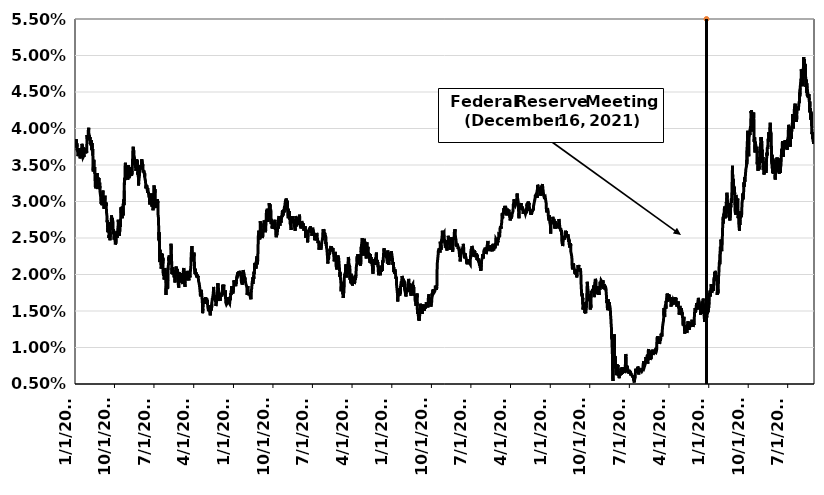
| Category | Series 0 |
|---|---|
| 1/1/10 | 0.038 |
| 1/4/10 | 0.038 |
| 1/5/10 | 0.038 |
| 1/6/10 | 0.038 |
| 1/7/10 | 0.038 |
| 1/8/10 | 0.038 |
| 1/11/10 | 0.038 |
| 1/12/10 | 0.037 |
| 1/13/10 | 0.038 |
| 1/14/10 | 0.038 |
| 1/15/10 | 0.037 |
| 1/18/10 | 0.037 |
| 1/19/10 | 0.037 |
| 1/20/10 | 0.037 |
| 1/21/10 | 0.036 |
| 1/22/10 | 0.036 |
| 1/25/10 | 0.037 |
| 1/26/10 | 0.036 |
| 1/27/10 | 0.037 |
| 1/28/10 | 0.037 |
| 1/29/10 | 0.036 |
| 2/1/10 | 0.037 |
| 2/2/10 | 0.037 |
| 2/3/10 | 0.037 |
| 2/4/10 | 0.036 |
| 2/5/10 | 0.036 |
| 2/8/10 | 0.036 |
| 2/9/10 | 0.037 |
| 2/10/10 | 0.037 |
| 2/11/10 | 0.037 |
| 2/12/10 | 0.037 |
| 2/15/10 | 0.037 |
| 2/16/10 | 0.037 |
| 2/17/10 | 0.037 |
| 2/18/10 | 0.038 |
| 2/19/10 | 0.038 |
| 2/22/10 | 0.038 |
| 2/23/10 | 0.037 |
| 2/24/10 | 0.037 |
| 2/25/10 | 0.036 |
| 2/26/10 | 0.036 |
| 3/1/10 | 0.036 |
| 3/2/10 | 0.036 |
| 3/3/10 | 0.036 |
| 3/4/10 | 0.036 |
| 3/5/10 | 0.037 |
| 3/8/10 | 0.037 |
| 3/9/10 | 0.037 |
| 3/10/10 | 0.037 |
| 3/11/10 | 0.037 |
| 3/12/10 | 0.037 |
| 3/15/10 | 0.037 |
| 3/16/10 | 0.037 |
| 3/17/10 | 0.036 |
| 3/18/10 | 0.037 |
| 3/19/10 | 0.037 |
| 3/22/10 | 0.037 |
| 3/23/10 | 0.037 |
| 3/24/10 | 0.038 |
| 3/25/10 | 0.039 |
| 3/26/10 | 0.039 |
| 3/29/10 | 0.039 |
| 3/30/10 | 0.039 |
| 3/31/10 | 0.038 |
| 4/1/10 | 0.039 |
| 4/2/10 | 0.04 |
| 4/5/10 | 0.04 |
| 4/6/10 | 0.04 |
| 4/7/10 | 0.039 |
| 4/8/10 | 0.039 |
| 4/9/10 | 0.039 |
| 4/12/10 | 0.039 |
| 4/13/10 | 0.038 |
| 4/14/10 | 0.039 |
| 4/15/10 | 0.039 |
| 4/16/10 | 0.038 |
| 4/19/10 | 0.038 |
| 4/20/10 | 0.038 |
| 4/21/10 | 0.038 |
| 4/22/10 | 0.038 |
| 4/23/10 | 0.038 |
| 4/26/10 | 0.038 |
| 4/27/10 | 0.037 |
| 4/28/10 | 0.038 |
| 4/29/10 | 0.038 |
| 4/30/10 | 0.037 |
| 5/3/10 | 0.037 |
| 5/4/10 | 0.036 |
| 5/5/10 | 0.036 |
| 5/6/10 | 0.034 |
| 5/7/10 | 0.034 |
| 5/10/10 | 0.036 |
| 5/11/10 | 0.036 |
| 5/12/10 | 0.036 |
| 5/13/10 | 0.036 |
| 5/14/10 | 0.034 |
| 5/17/10 | 0.035 |
| 5/18/10 | 0.034 |
| 5/19/10 | 0.034 |
| 5/20/10 | 0.032 |
| 5/21/10 | 0.032 |
| 5/24/10 | 0.032 |
| 5/25/10 | 0.032 |
| 5/26/10 | 0.032 |
| 5/27/10 | 0.033 |
| 5/28/10 | 0.033 |
| 5/31/10 | 0.033 |
| 6/1/10 | 0.033 |
| 6/2/10 | 0.034 |
| 6/3/10 | 0.034 |
| 6/4/10 | 0.032 |
| 6/7/10 | 0.032 |
| 6/8/10 | 0.032 |
| 6/9/10 | 0.032 |
| 6/10/10 | 0.033 |
| 6/11/10 | 0.032 |
| 6/14/10 | 0.033 |
| 6/15/10 | 0.033 |
| 6/16/10 | 0.033 |
| 6/17/10 | 0.032 |
| 6/18/10 | 0.032 |
| 6/21/10 | 0.033 |
| 6/22/10 | 0.032 |
| 6/23/10 | 0.031 |
| 6/24/10 | 0.031 |
| 6/25/10 | 0.031 |
| 6/28/10 | 0.03 |
| 6/29/10 | 0.03 |
| 6/30/10 | 0.03 |
| 7/1/10 | 0.03 |
| 7/2/10 | 0.03 |
| 7/5/10 | 0.03 |
| 7/6/10 | 0.03 |
| 7/7/10 | 0.03 |
| 7/8/10 | 0.03 |
| 7/9/10 | 0.031 |
| 7/12/10 | 0.031 |
| 7/13/10 | 0.032 |
| 7/14/10 | 0.031 |
| 7/15/10 | 0.03 |
| 7/16/10 | 0.03 |
| 7/19/10 | 0.03 |
| 7/20/10 | 0.03 |
| 7/21/10 | 0.029 |
| 7/22/10 | 0.03 |
| 7/23/10 | 0.03 |
| 7/26/10 | 0.03 |
| 7/27/10 | 0.031 |
| 7/28/10 | 0.03 |
| 7/29/10 | 0.03 |
| 7/30/10 | 0.029 |
| 8/2/10 | 0.03 |
| 8/3/10 | 0.029 |
| 8/4/10 | 0.03 |
| 8/5/10 | 0.029 |
| 8/6/10 | 0.029 |
| 8/9/10 | 0.029 |
| 8/10/10 | 0.028 |
| 8/11/10 | 0.027 |
| 8/12/10 | 0.027 |
| 8/13/10 | 0.027 |
| 8/16/10 | 0.026 |
| 8/17/10 | 0.026 |
| 8/18/10 | 0.026 |
| 8/19/10 | 0.026 |
| 8/20/10 | 0.026 |
| 8/23/10 | 0.026 |
| 8/24/10 | 0.025 |
| 8/25/10 | 0.025 |
| 8/26/10 | 0.025 |
| 8/27/10 | 0.027 |
| 8/30/10 | 0.025 |
| 8/31/10 | 0.025 |
| 9/1/10 | 0.026 |
| 9/2/10 | 0.026 |
| 9/3/10 | 0.027 |
| 9/6/10 | 0.027 |
| 9/7/10 | 0.026 |
| 9/8/10 | 0.027 |
| 9/9/10 | 0.028 |
| 9/10/10 | 0.028 |
| 9/13/10 | 0.027 |
| 9/14/10 | 0.027 |
| 9/15/10 | 0.027 |
| 9/16/10 | 0.028 |
| 9/17/10 | 0.028 |
| 9/20/10 | 0.027 |
| 9/21/10 | 0.026 |
| 9/22/10 | 0.026 |
| 9/23/10 | 0.026 |
| 9/24/10 | 0.026 |
| 9/27/10 | 0.025 |
| 9/28/10 | 0.025 |
| 9/29/10 | 0.025 |
| 9/30/10 | 0.025 |
| 10/1/10 | 0.025 |
| 10/4/10 | 0.025 |
| 10/5/10 | 0.025 |
| 10/6/10 | 0.024 |
| 10/7/10 | 0.024 |
| 10/8/10 | 0.024 |
| 10/12/10 | 0.024 |
| 10/13/10 | 0.025 |
| 10/14/10 | 0.025 |
| 10/15/10 | 0.026 |
| 10/18/10 | 0.025 |
| 10/19/10 | 0.025 |
| 10/20/10 | 0.025 |
| 10/21/10 | 0.026 |
| 10/22/10 | 0.026 |
| 10/25/10 | 0.026 |
| 10/26/10 | 0.027 |
| 10/27/10 | 0.028 |
| 10/28/10 | 0.027 |
| 10/29/10 | 0.026 |
| 11/1/10 | 0.027 |
| 11/2/10 | 0.026 |
| 11/3/10 | 0.027 |
| 11/4/10 | 0.025 |
| 11/5/10 | 0.026 |
| 11/8/10 | 0.026 |
| 11/9/10 | 0.027 |
| 11/10/10 | 0.026 |
| 11/11/10 | 0.026 |
| 11/12/10 | 0.028 |
| 11/15/10 | 0.029 |
| 11/16/10 | 0.028 |
| 11/17/10 | 0.029 |
| 11/18/10 | 0.029 |
| 11/19/10 | 0.029 |
| 11/22/10 | 0.028 |
| 11/23/10 | 0.028 |
| 11/24/10 | 0.029 |
| 11/25/10 | 0.029 |
| 11/26/10 | 0.029 |
| 11/29/10 | 0.028 |
| 11/30/10 | 0.028 |
| 12/1/10 | 0.03 |
| 12/2/10 | 0.03 |
| 12/3/10 | 0.03 |
| 12/6/10 | 0.03 |
| 12/7/10 | 0.032 |
| 12/8/10 | 0.033 |
| 12/9/10 | 0.032 |
| 12/10/10 | 0.033 |
| 12/13/10 | 0.033 |
| 12/14/10 | 0.035 |
| 12/15/10 | 0.035 |
| 12/16/10 | 0.035 |
| 12/17/10 | 0.033 |
| 12/20/10 | 0.034 |
| 12/21/10 | 0.034 |
| 12/22/10 | 0.034 |
| 12/23/10 | 0.034 |
| 12/24/10 | 0.034 |
| 12/27/10 | 0.034 |
| 12/28/10 | 0.035 |
| 12/29/10 | 0.034 |
| 12/30/10 | 0.034 |
| 12/31/10 | 0.033 |
| 1/3/11 | 0.034 |
| 1/4/11 | 0.034 |
| 1/5/11 | 0.035 |
| 1/6/11 | 0.034 |
| 1/7/11 | 0.033 |
| 1/10/11 | 0.033 |
| 1/11/11 | 0.034 |
| 1/12/11 | 0.034 |
| 1/13/11 | 0.033 |
| 1/14/11 | 0.034 |
| 1/17/11 | 0.034 |
| 1/18/11 | 0.034 |
| 1/19/11 | 0.034 |
| 1/20/11 | 0.035 |
| 1/21/11 | 0.034 |
| 1/24/11 | 0.034 |
| 1/25/11 | 0.034 |
| 1/26/11 | 0.034 |
| 1/27/11 | 0.034 |
| 1/28/11 | 0.034 |
| 1/31/11 | 0.034 |
| 2/1/11 | 0.035 |
| 2/2/11 | 0.035 |
| 2/3/11 | 0.036 |
| 2/4/11 | 0.037 |
| 2/7/11 | 0.037 |
| 2/8/11 | 0.038 |
| 2/9/11 | 0.036 |
| 2/10/11 | 0.037 |
| 2/11/11 | 0.036 |
| 2/14/11 | 0.036 |
| 2/15/11 | 0.036 |
| 2/16/11 | 0.036 |
| 2/17/11 | 0.036 |
| 2/18/11 | 0.036 |
| 2/21/11 | 0.036 |
| 2/22/11 | 0.035 |
| 2/23/11 | 0.035 |
| 2/24/11 | 0.035 |
| 2/25/11 | 0.034 |
| 2/28/11 | 0.034 |
| 3/1/11 | 0.034 |
| 3/2/11 | 0.035 |
| 3/3/11 | 0.036 |
| 3/4/11 | 0.035 |
| 3/7/11 | 0.035 |
| 3/8/11 | 0.036 |
| 3/9/11 | 0.035 |
| 3/10/11 | 0.034 |
| 3/11/11 | 0.034 |
| 3/14/11 | 0.034 |
| 3/15/11 | 0.033 |
| 3/16/11 | 0.032 |
| 3/17/11 | 0.032 |
| 3/18/11 | 0.033 |
| 3/21/11 | 0.033 |
| 3/22/11 | 0.033 |
| 3/23/11 | 0.034 |
| 3/24/11 | 0.034 |
| 3/25/11 | 0.035 |
| 3/28/11 | 0.035 |
| 3/29/11 | 0.035 |
| 3/30/11 | 0.035 |
| 3/31/11 | 0.035 |
| 4/1/11 | 0.035 |
| 4/4/11 | 0.034 |
| 4/5/11 | 0.035 |
| 4/6/11 | 0.036 |
| 4/7/11 | 0.036 |
| 4/8/11 | 0.036 |
| 4/11/11 | 0.036 |
| 4/12/11 | 0.035 |
| 4/13/11 | 0.035 |
| 4/14/11 | 0.035 |
| 4/15/11 | 0.034 |
| 4/18/11 | 0.034 |
| 4/19/11 | 0.034 |
| 4/20/11 | 0.034 |
| 4/21/11 | 0.034 |
| 4/22/11 | 0.034 |
| 4/25/11 | 0.034 |
| 4/26/11 | 0.033 |
| 4/27/11 | 0.034 |
| 4/28/11 | 0.033 |
| 4/29/11 | 0.033 |
| 5/2/11 | 0.033 |
| 5/3/11 | 0.033 |
| 5/4/11 | 0.032 |
| 5/5/11 | 0.032 |
| 5/6/11 | 0.032 |
| 5/9/11 | 0.032 |
| 5/10/11 | 0.032 |
| 5/11/11 | 0.032 |
| 5/12/11 | 0.032 |
| 5/13/11 | 0.032 |
| 5/16/11 | 0.032 |
| 5/17/11 | 0.031 |
| 5/18/11 | 0.032 |
| 5/19/11 | 0.032 |
| 5/20/11 | 0.032 |
| 5/23/11 | 0.031 |
| 5/24/11 | 0.031 |
| 5/25/11 | 0.031 |
| 5/26/11 | 0.031 |
| 5/27/11 | 0.031 |
| 5/30/11 | 0.031 |
| 5/31/11 | 0.03 |
| 6/1/11 | 0.03 |
| 6/2/11 | 0.03 |
| 6/3/11 | 0.03 |
| 6/6/11 | 0.03 |
| 6/7/11 | 0.03 |
| 6/8/11 | 0.03 |
| 6/9/11 | 0.03 |
| 6/10/11 | 0.03 |
| 6/13/11 | 0.03 |
| 6/14/11 | 0.031 |
| 6/15/11 | 0.03 |
| 6/16/11 | 0.029 |
| 6/17/11 | 0.029 |
| 6/20/11 | 0.03 |
| 6/21/11 | 0.03 |
| 6/22/11 | 0.03 |
| 6/23/11 | 0.029 |
| 6/24/11 | 0.029 |
| 6/27/11 | 0.03 |
| 6/28/11 | 0.03 |
| 6/29/11 | 0.031 |
| 6/30/11 | 0.032 |
| 7/1/11 | 0.032 |
| 7/4/11 | 0.032 |
| 7/5/11 | 0.032 |
| 7/6/11 | 0.031 |
| 7/7/11 | 0.032 |
| 7/8/11 | 0.03 |
| 7/11/11 | 0.029 |
| 7/12/11 | 0.029 |
| 7/13/11 | 0.029 |
| 7/14/11 | 0.03 |
| 7/15/11 | 0.029 |
| 7/18/11 | 0.029 |
| 7/19/11 | 0.029 |
| 7/20/11 | 0.03 |
| 7/21/11 | 0.03 |
| 7/22/11 | 0.03 |
| 7/25/11 | 0.03 |
| 7/26/11 | 0.03 |
| 7/27/11 | 0.03 |
| 7/28/11 | 0.03 |
| 7/29/11 | 0.028 |
| 8/1/11 | 0.028 |
| 8/2/11 | 0.027 |
| 8/3/11 | 0.026 |
| 8/4/11 | 0.025 |
| 8/5/11 | 0.026 |
| 8/8/11 | 0.024 |
| 8/9/11 | 0.022 |
| 8/10/11 | 0.022 |
| 8/11/11 | 0.023 |
| 8/12/11 | 0.022 |
| 8/15/11 | 0.023 |
| 8/16/11 | 0.022 |
| 8/17/11 | 0.022 |
| 8/18/11 | 0.021 |
| 8/19/11 | 0.021 |
| 8/22/11 | 0.021 |
| 8/23/11 | 0.022 |
| 8/24/11 | 0.023 |
| 8/25/11 | 0.022 |
| 8/26/11 | 0.022 |
| 8/29/11 | 0.023 |
| 8/30/11 | 0.022 |
| 8/31/11 | 0.022 |
| 9/1/11 | 0.022 |
| 9/2/11 | 0.02 |
| 9/5/11 | 0.02 |
| 9/6/11 | 0.02 |
| 9/7/11 | 0.02 |
| 9/8/11 | 0.02 |
| 9/9/11 | 0.019 |
| 9/12/11 | 0.019 |
| 9/13/11 | 0.02 |
| 9/14/11 | 0.02 |
| 9/15/11 | 0.021 |
| 9/16/11 | 0.021 |
| 9/19/11 | 0.02 |
| 9/20/11 | 0.02 |
| 9/21/11 | 0.019 |
| 9/22/11 | 0.017 |
| 9/23/11 | 0.018 |
| 9/26/11 | 0.019 |
| 9/27/11 | 0.02 |
| 9/28/11 | 0.02 |
| 9/29/11 | 0.02 |
| 9/30/11 | 0.019 |
| 10/3/11 | 0.018 |
| 10/4/11 | 0.018 |
| 10/5/11 | 0.019 |
| 10/6/11 | 0.02 |
| 10/7/11 | 0.021 |
| 10/11/11 | 0.022 |
| 10/12/11 | 0.022 |
| 10/13/11 | 0.022 |
| 10/14/11 | 0.023 |
| 10/17/11 | 0.022 |
| 10/18/11 | 0.022 |
| 10/19/11 | 0.022 |
| 10/20/11 | 0.022 |
| 10/21/11 | 0.022 |
| 10/24/11 | 0.022 |
| 10/25/11 | 0.021 |
| 10/26/11 | 0.022 |
| 10/27/11 | 0.024 |
| 10/28/11 | 0.023 |
| 10/31/11 | 0.022 |
| 11/1/11 | 0.02 |
| 11/2/11 | 0.02 |
| 11/3/11 | 0.021 |
| 11/4/11 | 0.021 |
| 11/7/11 | 0.02 |
| 11/8/11 | 0.021 |
| 11/9/11 | 0.02 |
| 11/10/11 | 0.02 |
| 11/14/11 | 0.02 |
| 11/15/11 | 0.021 |
| 11/16/11 | 0.02 |
| 11/17/11 | 0.02 |
| 11/18/11 | 0.02 |
| 11/21/11 | 0.02 |
| 11/22/11 | 0.019 |
| 11/23/11 | 0.019 |
| 11/24/11 | 0.019 |
| 11/25/11 | 0.02 |
| 11/28/11 | 0.02 |
| 11/29/11 | 0.02 |
| 11/30/11 | 0.021 |
| 12/1/11 | 0.021 |
| 12/2/11 | 0.02 |
| 12/5/11 | 0.02 |
| 12/6/11 | 0.021 |
| 12/7/11 | 0.02 |
| 12/8/11 | 0.02 |
| 12/9/11 | 0.021 |
| 12/12/11 | 0.02 |
| 12/13/11 | 0.02 |
| 12/14/11 | 0.019 |
| 12/15/11 | 0.019 |
| 12/16/11 | 0.019 |
| 12/19/11 | 0.018 |
| 12/20/11 | 0.019 |
| 12/21/11 | 0.02 |
| 12/22/11 | 0.02 |
| 12/23/11 | 0.02 |
| 12/26/11 | 0.02 |
| 12/27/11 | 0.02 |
| 12/28/11 | 0.019 |
| 12/29/11 | 0.019 |
| 12/30/11 | 0.019 |
| 1/2/12 | 0.019 |
| 1/3/12 | 0.02 |
| 1/4/12 | 0.02 |
| 1/5/12 | 0.02 |
| 1/6/12 | 0.02 |
| 1/9/12 | 0.02 |
| 1/10/12 | 0.02 |
| 1/11/12 | 0.019 |
| 1/12/12 | 0.019 |
| 1/13/12 | 0.019 |
| 1/16/12 | 0.019 |
| 1/17/12 | 0.019 |
| 1/18/12 | 0.019 |
| 1/19/12 | 0.02 |
| 1/20/12 | 0.02 |
| 1/23/12 | 0.021 |
| 1/24/12 | 0.021 |
| 1/25/12 | 0.02 |
| 1/26/12 | 0.02 |
| 1/27/12 | 0.019 |
| 1/30/12 | 0.019 |
| 1/31/12 | 0.018 |
| 2/1/12 | 0.019 |
| 2/2/12 | 0.019 |
| 2/3/12 | 0.02 |
| 2/6/12 | 0.019 |
| 2/7/12 | 0.02 |
| 2/8/12 | 0.02 |
| 2/9/12 | 0.02 |
| 2/10/12 | 0.02 |
| 2/13/12 | 0.02 |
| 2/14/12 | 0.019 |
| 2/15/12 | 0.019 |
| 2/16/12 | 0.02 |
| 2/17/12 | 0.02 |
| 2/20/12 | 0.02 |
| 2/21/12 | 0.02 |
| 2/22/12 | 0.02 |
| 2/23/12 | 0.02 |
| 2/24/12 | 0.02 |
| 2/27/12 | 0.019 |
| 2/28/12 | 0.019 |
| 2/29/12 | 0.02 |
| 3/1/12 | 0.02 |
| 3/2/12 | 0.02 |
| 3/5/12 | 0.02 |
| 3/6/12 | 0.02 |
| 3/7/12 | 0.02 |
| 3/8/12 | 0.02 |
| 3/9/12 | 0.02 |
| 3/12/12 | 0.02 |
| 3/13/12 | 0.021 |
| 3/14/12 | 0.023 |
| 3/15/12 | 0.023 |
| 3/16/12 | 0.023 |
| 3/19/12 | 0.024 |
| 3/20/12 | 0.024 |
| 3/21/12 | 0.023 |
| 3/22/12 | 0.023 |
| 3/23/12 | 0.022 |
| 3/26/12 | 0.023 |
| 3/27/12 | 0.022 |
| 3/28/12 | 0.022 |
| 3/29/12 | 0.022 |
| 3/30/12 | 0.022 |
| 4/2/12 | 0.022 |
| 4/3/12 | 0.023 |
| 4/4/12 | 0.022 |
| 4/5/12 | 0.022 |
| 4/6/12 | 0.021 |
| 4/9/12 | 0.021 |
| 4/10/12 | 0.02 |
| 4/11/12 | 0.02 |
| 4/12/12 | 0.021 |
| 4/13/12 | 0.02 |
| 4/16/12 | 0.02 |
| 4/17/12 | 0.02 |
| 4/18/12 | 0.02 |
| 4/19/12 | 0.02 |
| 4/20/12 | 0.02 |
| 4/23/12 | 0.02 |
| 4/24/12 | 0.02 |
| 4/25/12 | 0.02 |
| 4/26/12 | 0.02 |
| 4/27/12 | 0.02 |
| 4/30/12 | 0.02 |
| 5/1/12 | 0.02 |
| 5/2/12 | 0.02 |
| 5/3/12 | 0.02 |
| 5/4/12 | 0.019 |
| 5/7/12 | 0.019 |
| 5/8/12 | 0.019 |
| 5/9/12 | 0.019 |
| 5/10/12 | 0.019 |
| 5/11/12 | 0.018 |
| 5/14/12 | 0.018 |
| 5/15/12 | 0.018 |
| 5/16/12 | 0.018 |
| 5/17/12 | 0.017 |
| 5/18/12 | 0.017 |
| 5/21/12 | 0.018 |
| 5/22/12 | 0.018 |
| 5/23/12 | 0.017 |
| 5/24/12 | 0.018 |
| 5/25/12 | 0.018 |
| 5/28/12 | 0.018 |
| 5/29/12 | 0.017 |
| 5/30/12 | 0.016 |
| 5/31/12 | 0.016 |
| 6/1/12 | 0.015 |
| 6/4/12 | 0.015 |
| 6/5/12 | 0.016 |
| 6/6/12 | 0.017 |
| 6/7/12 | 0.017 |
| 6/8/12 | 0.016 |
| 6/11/12 | 0.016 |
| 6/12/12 | 0.017 |
| 6/13/12 | 0.016 |
| 6/14/12 | 0.016 |
| 6/15/12 | 0.016 |
| 6/18/12 | 0.016 |
| 6/19/12 | 0.016 |
| 6/20/12 | 0.016 |
| 6/21/12 | 0.016 |
| 6/22/12 | 0.017 |
| 6/25/12 | 0.016 |
| 6/26/12 | 0.017 |
| 6/27/12 | 0.016 |
| 6/28/12 | 0.016 |
| 6/29/12 | 0.017 |
| 7/2/12 | 0.016 |
| 7/3/12 | 0.016 |
| 7/4/12 | 0.016 |
| 7/5/12 | 0.016 |
| 7/6/12 | 0.016 |
| 7/9/12 | 0.015 |
| 7/10/12 | 0.015 |
| 7/11/12 | 0.015 |
| 7/12/12 | 0.015 |
| 7/13/12 | 0.015 |
| 7/16/12 | 0.015 |
| 7/17/12 | 0.015 |
| 7/18/12 | 0.015 |
| 7/19/12 | 0.015 |
| 7/20/12 | 0.015 |
| 7/23/12 | 0.015 |
| 7/24/12 | 0.014 |
| 7/25/12 | 0.014 |
| 7/26/12 | 0.014 |
| 7/27/12 | 0.016 |
| 7/30/12 | 0.015 |
| 7/31/12 | 0.015 |
| 8/1/12 | 0.016 |
| 8/2/12 | 0.015 |
| 8/3/12 | 0.016 |
| 8/6/12 | 0.016 |
| 8/7/12 | 0.017 |
| 8/8/12 | 0.017 |
| 8/9/12 | 0.017 |
| 8/10/12 | 0.016 |
| 8/13/12 | 0.016 |
| 8/14/12 | 0.017 |
| 8/15/12 | 0.018 |
| 8/16/12 | 0.018 |
| 8/17/12 | 0.018 |
| 8/20/12 | 0.018 |
| 8/21/12 | 0.018 |
| 8/22/12 | 0.017 |
| 8/23/12 | 0.017 |
| 8/24/12 | 0.017 |
| 8/27/12 | 0.016 |
| 8/28/12 | 0.016 |
| 8/29/12 | 0.017 |
| 8/30/12 | 0.016 |
| 8/31/12 | 0.016 |
| 9/3/12 | 0.016 |
| 9/4/12 | 0.016 |
| 9/5/12 | 0.016 |
| 9/6/12 | 0.017 |
| 9/7/12 | 0.017 |
| 9/10/12 | 0.017 |
| 9/11/12 | 0.017 |
| 9/12/12 | 0.018 |
| 9/13/12 | 0.018 |
| 9/14/12 | 0.019 |
| 9/17/12 | 0.019 |
| 9/18/12 | 0.018 |
| 9/19/12 | 0.018 |
| 9/20/12 | 0.018 |
| 9/21/12 | 0.018 |
| 9/24/12 | 0.017 |
| 9/25/12 | 0.017 |
| 9/26/12 | 0.016 |
| 9/27/12 | 0.017 |
| 9/28/12 | 0.016 |
| 10/1/12 | 0.016 |
| 10/2/12 | 0.016 |
| 10/3/12 | 0.016 |
| 10/4/12 | 0.017 |
| 10/5/12 | 0.018 |
| 10/9/12 | 0.017 |
| 10/10/12 | 0.017 |
| 10/11/12 | 0.017 |
| 10/12/12 | 0.017 |
| 10/15/12 | 0.017 |
| 10/16/12 | 0.018 |
| 10/17/12 | 0.018 |
| 10/18/12 | 0.019 |
| 10/19/12 | 0.018 |
| 10/22/12 | 0.018 |
| 10/23/12 | 0.018 |
| 10/24/12 | 0.018 |
| 10/25/12 | 0.019 |
| 10/26/12 | 0.018 |
| 10/29/12 | 0.017 |
| 10/30/12 | 0.017 |
| 10/31/12 | 0.017 |
| 11/1/12 | 0.018 |
| 11/2/12 | 0.018 |
| 11/5/12 | 0.017 |
| 11/6/12 | 0.018 |
| 11/7/12 | 0.017 |
| 11/8/12 | 0.016 |
| 11/9/12 | 0.016 |
| 11/13/12 | 0.016 |
| 11/14/12 | 0.016 |
| 11/15/12 | 0.016 |
| 11/16/12 | 0.016 |
| 11/19/12 | 0.016 |
| 11/20/12 | 0.017 |
| 11/21/12 | 0.017 |
| 11/22/12 | 0.017 |
| 11/23/12 | 0.017 |
| 11/26/12 | 0.017 |
| 11/27/12 | 0.016 |
| 11/28/12 | 0.016 |
| 11/29/12 | 0.016 |
| 11/30/12 | 0.016 |
| 12/3/12 | 0.016 |
| 12/4/12 | 0.016 |
| 12/5/12 | 0.016 |
| 12/6/12 | 0.016 |
| 12/7/12 | 0.016 |
| 12/10/12 | 0.016 |
| 12/11/12 | 0.017 |
| 12/12/12 | 0.017 |
| 12/13/12 | 0.017 |
| 12/14/12 | 0.017 |
| 12/17/12 | 0.018 |
| 12/18/12 | 0.018 |
| 12/19/12 | 0.018 |
| 12/20/12 | 0.018 |
| 12/21/12 | 0.018 |
| 12/24/12 | 0.018 |
| 12/25/12 | 0.018 |
| 12/26/12 | 0.018 |
| 12/27/12 | 0.017 |
| 12/28/12 | 0.017 |
| 12/31/12 | 0.018 |
| 1/1/13 | 0.018 |
| 1/2/13 | 0.019 |
| 1/3/13 | 0.019 |
| 1/4/13 | 0.019 |
| 1/7/13 | 0.019 |
| 1/8/13 | 0.019 |
| 1/9/13 | 0.019 |
| 1/10/13 | 0.019 |
| 1/11/13 | 0.019 |
| 1/14/13 | 0.019 |
| 1/15/13 | 0.019 |
| 1/16/13 | 0.018 |
| 1/17/13 | 0.019 |
| 1/18/13 | 0.019 |
| 1/21/13 | 0.019 |
| 1/22/13 | 0.019 |
| 1/23/13 | 0.019 |
| 1/24/13 | 0.019 |
| 1/25/13 | 0.02 |
| 1/28/13 | 0.02 |
| 1/29/13 | 0.02 |
| 1/30/13 | 0.02 |
| 1/31/13 | 0.02 |
| 2/1/13 | 0.02 |
| 2/4/13 | 0.02 |
| 2/5/13 | 0.02 |
| 2/6/13 | 0.02 |
| 2/7/13 | 0.02 |
| 2/8/13 | 0.02 |
| 2/11/13 | 0.02 |
| 2/12/13 | 0.02 |
| 2/13/13 | 0.02 |
| 2/14/13 | 0.02 |
| 2/15/13 | 0.02 |
| 2/18/13 | 0.02 |
| 2/19/13 | 0.02 |
| 2/20/13 | 0.02 |
| 2/21/13 | 0.02 |
| 2/22/13 | 0.02 |
| 2/25/13 | 0.019 |
| 2/26/13 | 0.019 |
| 2/27/13 | 0.019 |
| 2/28/13 | 0.019 |
| 3/1/13 | 0.019 |
| 3/4/13 | 0.019 |
| 3/5/13 | 0.019 |
| 3/6/13 | 0.02 |
| 3/7/13 | 0.02 |
| 3/8/13 | 0.021 |
| 3/11/13 | 0.021 |
| 3/12/13 | 0.02 |
| 3/13/13 | 0.02 |
| 3/14/13 | 0.02 |
| 3/15/13 | 0.02 |
| 3/18/13 | 0.02 |
| 3/19/13 | 0.019 |
| 3/20/13 | 0.02 |
| 3/21/13 | 0.02 |
| 3/22/13 | 0.019 |
| 3/25/13 | 0.019 |
| 3/26/13 | 0.019 |
| 3/27/13 | 0.019 |
| 3/28/13 | 0.019 |
| 3/29/13 | 0.019 |
| 4/1/13 | 0.019 |
| 4/2/13 | 0.019 |
| 4/3/13 | 0.018 |
| 4/4/13 | 0.018 |
| 4/5/13 | 0.017 |
| 4/8/13 | 0.018 |
| 4/9/13 | 0.018 |
| 4/10/13 | 0.018 |
| 4/11/13 | 0.018 |
| 4/12/13 | 0.018 |
| 4/15/13 | 0.017 |
| 4/16/13 | 0.018 |
| 4/17/13 | 0.017 |
| 4/18/13 | 0.017 |
| 4/19/13 | 0.017 |
| 4/22/13 | 0.017 |
| 4/23/13 | 0.017 |
| 4/24/13 | 0.017 |
| 4/25/13 | 0.017 |
| 4/26/13 | 0.017 |
| 4/29/13 | 0.017 |
| 4/30/13 | 0.017 |
| 5/1/13 | 0.017 |
| 5/2/13 | 0.017 |
| 5/3/13 | 0.018 |
| 5/6/13 | 0.018 |
| 5/7/13 | 0.018 |
| 5/8/13 | 0.018 |
| 5/9/13 | 0.018 |
| 5/10/13 | 0.019 |
| 5/13/13 | 0.019 |
| 5/14/13 | 0.02 |
| 5/15/13 | 0.019 |
| 5/16/13 | 0.019 |
| 5/17/13 | 0.02 |
| 5/20/13 | 0.02 |
| 5/21/13 | 0.019 |
| 5/22/13 | 0.02 |
| 5/23/13 | 0.02 |
| 5/24/13 | 0.02 |
| 5/27/13 | 0.02 |
| 5/28/13 | 0.022 |
| 5/29/13 | 0.021 |
| 5/30/13 | 0.021 |
| 5/31/13 | 0.022 |
| 6/3/13 | 0.021 |
| 6/4/13 | 0.021 |
| 6/5/13 | 0.021 |
| 6/6/13 | 0.021 |
| 6/7/13 | 0.022 |
| 6/10/13 | 0.022 |
| 6/11/13 | 0.022 |
| 6/12/13 | 0.022 |
| 6/13/13 | 0.022 |
| 6/14/13 | 0.021 |
| 6/17/13 | 0.022 |
| 6/18/13 | 0.022 |
| 6/19/13 | 0.023 |
| 6/20/13 | 0.024 |
| 6/21/13 | 0.025 |
| 6/24/13 | 0.026 |
| 6/25/13 | 0.026 |
| 6/26/13 | 0.026 |
| 6/27/13 | 0.025 |
| 6/28/13 | 0.025 |
| 7/1/13 | 0.025 |
| 7/2/13 | 0.025 |
| 7/3/13 | 0.025 |
| 7/4/13 | 0.025 |
| 7/5/13 | 0.027 |
| 7/8/13 | 0.026 |
| 7/9/13 | 0.026 |
| 7/10/13 | 0.027 |
| 7/11/13 | 0.026 |
| 7/12/13 | 0.026 |
| 7/15/13 | 0.026 |
| 7/16/13 | 0.026 |
| 7/17/13 | 0.025 |
| 7/18/13 | 0.026 |
| 7/19/13 | 0.025 |
| 7/22/13 | 0.025 |
| 7/23/13 | 0.025 |
| 7/24/13 | 0.026 |
| 7/25/13 | 0.026 |
| 7/26/13 | 0.026 |
| 7/29/13 | 0.026 |
| 7/30/13 | 0.026 |
| 7/31/13 | 0.026 |
| 8/1/13 | 0.027 |
| 8/2/13 | 0.026 |
| 8/5/13 | 0.027 |
| 8/6/13 | 0.027 |
| 8/7/13 | 0.026 |
| 8/8/13 | 0.026 |
| 8/9/13 | 0.026 |
| 8/12/13 | 0.026 |
| 8/13/13 | 0.027 |
| 8/14/13 | 0.027 |
| 8/15/13 | 0.028 |
| 8/16/13 | 0.028 |
| 8/19/13 | 0.029 |
| 8/20/13 | 0.028 |
| 8/21/13 | 0.029 |
| 8/22/13 | 0.029 |
| 8/23/13 | 0.028 |
| 8/26/13 | 0.028 |
| 8/27/13 | 0.027 |
| 8/28/13 | 0.028 |
| 8/29/13 | 0.028 |
| 8/30/13 | 0.028 |
| 9/2/13 | 0.028 |
| 9/3/13 | 0.029 |
| 9/4/13 | 0.029 |
| 9/5/13 | 0.03 |
| 9/6/13 | 0.029 |
| 9/9/13 | 0.029 |
| 9/10/13 | 0.03 |
| 9/11/13 | 0.029 |
| 9/12/13 | 0.029 |
| 9/13/13 | 0.029 |
| 9/16/13 | 0.029 |
| 9/17/13 | 0.029 |
| 9/18/13 | 0.027 |
| 9/19/13 | 0.028 |
| 9/20/13 | 0.028 |
| 9/23/13 | 0.027 |
| 9/24/13 | 0.027 |
| 9/25/13 | 0.026 |
| 9/26/13 | 0.027 |
| 9/27/13 | 0.026 |
| 9/30/13 | 0.026 |
| 10/1/13 | 0.027 |
| 10/2/13 | 0.026 |
| 10/3/13 | 0.026 |
| 10/4/13 | 0.027 |
| 10/7/13 | 0.026 |
| 10/8/13 | 0.027 |
| 10/9/13 | 0.027 |
| 10/10/13 | 0.027 |
| 10/11/13 | 0.027 |
| 10/15/13 | 0.028 |
| 10/16/13 | 0.027 |
| 10/17/13 | 0.026 |
| 10/18/13 | 0.026 |
| 10/21/13 | 0.026 |
| 10/22/13 | 0.025 |
| 10/23/13 | 0.025 |
| 10/24/13 | 0.025 |
| 10/25/13 | 0.025 |
| 10/28/13 | 0.025 |
| 10/29/13 | 0.025 |
| 10/30/13 | 0.026 |
| 10/31/13 | 0.026 |
| 11/1/13 | 0.026 |
| 11/4/13 | 0.026 |
| 11/5/13 | 0.027 |
| 11/6/13 | 0.027 |
| 11/7/13 | 0.026 |
| 11/8/13 | 0.028 |
| 11/12/13 | 0.028 |
| 11/13/13 | 0.028 |
| 11/14/13 | 0.027 |
| 11/15/13 | 0.027 |
| 11/18/13 | 0.027 |
| 11/19/13 | 0.027 |
| 11/20/13 | 0.028 |
| 11/21/13 | 0.028 |
| 11/22/13 | 0.028 |
| 11/25/13 | 0.027 |
| 11/26/13 | 0.027 |
| 11/27/13 | 0.027 |
| 11/28/13 | 0.027 |
| 11/29/13 | 0.028 |
| 12/2/13 | 0.028 |
| 12/3/13 | 0.028 |
| 12/4/13 | 0.028 |
| 12/5/13 | 0.029 |
| 12/6/13 | 0.029 |
| 12/9/13 | 0.029 |
| 12/10/13 | 0.028 |
| 12/11/13 | 0.029 |
| 12/12/13 | 0.029 |
| 12/13/13 | 0.029 |
| 12/16/13 | 0.029 |
| 12/17/13 | 0.028 |
| 12/18/13 | 0.029 |
| 12/19/13 | 0.029 |
| 12/20/13 | 0.029 |
| 12/23/13 | 0.029 |
| 12/24/13 | 0.03 |
| 12/25/13 | 0.03 |
| 12/26/13 | 0.03 |
| 12/27/13 | 0.03 |
| 12/30/13 | 0.03 |
| 12/31/13 | 0.03 |
| 1/1/14 | 0.03 |
| 1/2/14 | 0.03 |
| 1/3/14 | 0.03 |
| 1/6/14 | 0.03 |
| 1/7/14 | 0.03 |
| 1/8/14 | 0.03 |
| 1/9/14 | 0.03 |
| 1/10/14 | 0.029 |
| 1/13/14 | 0.028 |
| 1/14/14 | 0.028 |
| 1/15/14 | 0.029 |
| 1/16/14 | 0.029 |
| 1/17/14 | 0.028 |
| 1/20/14 | 0.028 |
| 1/21/14 | 0.028 |
| 1/22/14 | 0.029 |
| 1/23/14 | 0.028 |
| 1/24/14 | 0.028 |
| 1/27/14 | 0.028 |
| 1/28/14 | 0.028 |
| 1/29/14 | 0.027 |
| 1/30/14 | 0.027 |
| 1/31/14 | 0.027 |
| 2/3/14 | 0.026 |
| 2/4/14 | 0.026 |
| 2/5/14 | 0.027 |
| 2/6/14 | 0.027 |
| 2/7/14 | 0.027 |
| 2/10/14 | 0.027 |
| 2/11/14 | 0.028 |
| 2/12/14 | 0.028 |
| 2/13/14 | 0.027 |
| 2/14/14 | 0.028 |
| 2/17/14 | 0.028 |
| 2/18/14 | 0.027 |
| 2/19/14 | 0.027 |
| 2/20/14 | 0.028 |
| 2/21/14 | 0.027 |
| 2/24/14 | 0.028 |
| 2/25/14 | 0.027 |
| 2/26/14 | 0.027 |
| 2/27/14 | 0.026 |
| 2/28/14 | 0.027 |
| 3/3/14 | 0.026 |
| 3/4/14 | 0.027 |
| 3/5/14 | 0.027 |
| 3/6/14 | 0.027 |
| 3/7/14 | 0.028 |
| 3/10/14 | 0.028 |
| 3/11/14 | 0.028 |
| 3/12/14 | 0.027 |
| 3/13/14 | 0.027 |
| 3/14/14 | 0.026 |
| 3/17/14 | 0.027 |
| 3/18/14 | 0.027 |
| 3/19/14 | 0.028 |
| 3/20/14 | 0.028 |
| 3/21/14 | 0.028 |
| 3/24/14 | 0.027 |
| 3/25/14 | 0.028 |
| 3/26/14 | 0.027 |
| 3/27/14 | 0.027 |
| 3/28/14 | 0.027 |
| 3/31/14 | 0.027 |
| 4/1/14 | 0.028 |
| 4/2/14 | 0.028 |
| 4/3/14 | 0.028 |
| 4/4/14 | 0.027 |
| 4/7/14 | 0.027 |
| 4/8/14 | 0.027 |
| 4/9/14 | 0.027 |
| 4/10/14 | 0.026 |
| 4/11/14 | 0.026 |
| 4/14/14 | 0.026 |
| 4/15/14 | 0.026 |
| 4/16/14 | 0.026 |
| 4/17/14 | 0.027 |
| 4/18/14 | 0.027 |
| 4/21/14 | 0.027 |
| 4/22/14 | 0.027 |
| 4/23/14 | 0.027 |
| 4/24/14 | 0.027 |
| 4/25/14 | 0.027 |
| 4/28/14 | 0.027 |
| 4/29/14 | 0.027 |
| 4/30/14 | 0.027 |
| 5/1/14 | 0.026 |
| 5/2/14 | 0.026 |
| 5/5/14 | 0.026 |
| 5/6/14 | 0.026 |
| 5/7/14 | 0.026 |
| 5/8/14 | 0.026 |
| 5/9/14 | 0.026 |
| 5/12/14 | 0.027 |
| 5/13/14 | 0.026 |
| 5/14/14 | 0.025 |
| 5/15/14 | 0.025 |
| 5/16/14 | 0.025 |
| 5/19/14 | 0.025 |
| 5/20/14 | 0.025 |
| 5/21/14 | 0.025 |
| 5/22/14 | 0.026 |
| 5/23/14 | 0.025 |
| 5/26/14 | 0.025 |
| 5/27/14 | 0.025 |
| 5/28/14 | 0.024 |
| 5/29/14 | 0.024 |
| 5/30/14 | 0.025 |
| 6/2/14 | 0.025 |
| 6/3/14 | 0.026 |
| 6/4/14 | 0.026 |
| 6/5/14 | 0.026 |
| 6/6/14 | 0.026 |
| 6/9/14 | 0.026 |
| 6/10/14 | 0.026 |
| 6/11/14 | 0.026 |
| 6/12/14 | 0.026 |
| 6/13/14 | 0.026 |
| 6/16/14 | 0.026 |
| 6/17/14 | 0.027 |
| 6/18/14 | 0.026 |
| 6/19/14 | 0.026 |
| 6/20/14 | 0.026 |
| 6/23/14 | 0.026 |
| 6/24/14 | 0.026 |
| 6/25/14 | 0.026 |
| 6/26/14 | 0.025 |
| 6/27/14 | 0.025 |
| 6/30/14 | 0.025 |
| 7/1/14 | 0.026 |
| 7/2/14 | 0.026 |
| 7/3/14 | 0.026 |
| 7/4/14 | 0.026 |
| 7/7/14 | 0.026 |
| 7/8/14 | 0.026 |
| 7/9/14 | 0.026 |
| 7/10/14 | 0.026 |
| 7/11/14 | 0.025 |
| 7/14/14 | 0.026 |
| 7/15/14 | 0.026 |
| 7/16/14 | 0.026 |
| 7/17/14 | 0.025 |
| 7/18/14 | 0.025 |
| 7/21/14 | 0.025 |
| 7/22/14 | 0.025 |
| 7/23/14 | 0.025 |
| 7/24/14 | 0.025 |
| 7/25/14 | 0.025 |
| 7/28/14 | 0.025 |
| 7/29/14 | 0.025 |
| 7/30/14 | 0.026 |
| 7/31/14 | 0.026 |
| 8/1/14 | 0.025 |
| 8/4/14 | 0.025 |
| 8/5/14 | 0.025 |
| 8/6/14 | 0.025 |
| 8/7/14 | 0.024 |
| 8/8/14 | 0.024 |
| 8/11/14 | 0.024 |
| 8/12/14 | 0.025 |
| 8/13/14 | 0.024 |
| 8/14/14 | 0.024 |
| 8/15/14 | 0.023 |
| 8/18/14 | 0.024 |
| 8/19/14 | 0.024 |
| 8/20/14 | 0.024 |
| 8/21/14 | 0.024 |
| 8/22/14 | 0.024 |
| 8/25/14 | 0.024 |
| 8/26/14 | 0.024 |
| 8/27/14 | 0.024 |
| 8/28/14 | 0.023 |
| 8/29/14 | 0.024 |
| 9/1/14 | 0.024 |
| 9/2/14 | 0.024 |
| 9/3/14 | 0.024 |
| 9/4/14 | 0.024 |
| 9/5/14 | 0.025 |
| 9/8/14 | 0.025 |
| 9/9/14 | 0.025 |
| 9/10/14 | 0.025 |
| 9/11/14 | 0.025 |
| 9/12/14 | 0.026 |
| 9/15/14 | 0.026 |
| 9/16/14 | 0.026 |
| 9/17/14 | 0.026 |
| 9/18/14 | 0.026 |
| 9/19/14 | 0.026 |
| 9/22/14 | 0.026 |
| 9/23/14 | 0.025 |
| 9/24/14 | 0.026 |
| 9/25/14 | 0.025 |
| 9/26/14 | 0.025 |
| 9/29/14 | 0.025 |
| 9/30/14 | 0.025 |
| 10/1/14 | 0.024 |
| 10/2/14 | 0.024 |
| 10/3/14 | 0.024 |
| 10/6/14 | 0.024 |
| 10/7/14 | 0.024 |
| 10/8/14 | 0.024 |
| 10/9/14 | 0.023 |
| 10/10/14 | 0.023 |
| 10/14/14 | 0.022 |
| 10/15/14 | 0.022 |
| 10/16/14 | 0.022 |
| 10/17/14 | 0.022 |
| 10/20/14 | 0.022 |
| 10/21/14 | 0.022 |
| 10/22/14 | 0.022 |
| 10/23/14 | 0.023 |
| 10/24/14 | 0.023 |
| 10/27/14 | 0.023 |
| 10/28/14 | 0.023 |
| 10/29/14 | 0.023 |
| 10/30/14 | 0.023 |
| 10/31/14 | 0.024 |
| 11/3/14 | 0.024 |
| 11/4/14 | 0.024 |
| 11/5/14 | 0.024 |
| 11/6/14 | 0.024 |
| 11/7/14 | 0.023 |
| 11/10/14 | 0.024 |
| 11/12/14 | 0.024 |
| 11/13/14 | 0.024 |
| 11/14/14 | 0.023 |
| 11/17/14 | 0.023 |
| 11/18/14 | 0.023 |
| 11/19/14 | 0.024 |
| 11/20/14 | 0.023 |
| 11/21/14 | 0.023 |
| 11/24/14 | 0.023 |
| 11/25/14 | 0.023 |
| 11/26/14 | 0.022 |
| 11/27/14 | 0.022 |
| 11/28/14 | 0.022 |
| 12/1/14 | 0.022 |
| 12/2/14 | 0.023 |
| 12/3/14 | 0.023 |
| 12/4/14 | 0.022 |
| 12/5/14 | 0.023 |
| 12/8/14 | 0.023 |
| 12/9/14 | 0.022 |
| 12/10/14 | 0.022 |
| 12/11/14 | 0.022 |
| 12/12/14 | 0.021 |
| 12/15/14 | 0.021 |
| 12/16/14 | 0.021 |
| 12/17/14 | 0.021 |
| 12/18/14 | 0.022 |
| 12/19/14 | 0.022 |
| 12/22/14 | 0.022 |
| 12/23/14 | 0.023 |
| 12/24/14 | 0.023 |
| 12/25/14 | 0.023 |
| 12/26/14 | 0.022 |
| 12/29/14 | 0.022 |
| 12/30/14 | 0.022 |
| 12/31/14 | 0.022 |
| 1/1/15 | 0.022 |
| 1/2/15 | 0.021 |
| 1/5/15 | 0.02 |
| 1/6/15 | 0.02 |
| 1/7/15 | 0.02 |
| 1/8/15 | 0.02 |
| 1/9/15 | 0.02 |
| 1/12/15 | 0.019 |
| 1/13/15 | 0.019 |
| 1/14/15 | 0.019 |
| 1/15/15 | 0.018 |
| 1/16/15 | 0.018 |
| 1/19/15 | 0.018 |
| 1/20/15 | 0.018 |
| 1/21/15 | 0.019 |
| 1/22/15 | 0.019 |
| 1/23/15 | 0.018 |
| 1/26/15 | 0.018 |
| 1/27/15 | 0.018 |
| 1/28/15 | 0.017 |
| 1/29/15 | 0.018 |
| 1/30/15 | 0.017 |
| 2/2/15 | 0.017 |
| 2/3/15 | 0.018 |
| 2/4/15 | 0.018 |
| 2/5/15 | 0.018 |
| 2/6/15 | 0.02 |
| 2/9/15 | 0.02 |
| 2/10/15 | 0.02 |
| 2/11/15 | 0.02 |
| 2/12/15 | 0.02 |
| 2/13/15 | 0.02 |
| 2/16/15 | 0.02 |
| 2/17/15 | 0.021 |
| 2/18/15 | 0.021 |
| 2/19/15 | 0.021 |
| 2/20/15 | 0.021 |
| 2/23/15 | 0.021 |
| 2/24/15 | 0.02 |
| 2/25/15 | 0.02 |
| 2/26/15 | 0.02 |
| 2/27/15 | 0.02 |
| 3/2/15 | 0.021 |
| 3/3/15 | 0.021 |
| 3/4/15 | 0.021 |
| 3/5/15 | 0.021 |
| 3/6/15 | 0.022 |
| 3/9/15 | 0.022 |
| 3/10/15 | 0.021 |
| 3/11/15 | 0.021 |
| 3/12/15 | 0.021 |
| 3/13/15 | 0.021 |
| 3/16/15 | 0.021 |
| 3/17/15 | 0.021 |
| 3/18/15 | 0.019 |
| 3/19/15 | 0.02 |
| 3/20/15 | 0.019 |
| 3/23/15 | 0.019 |
| 3/24/15 | 0.019 |
| 3/25/15 | 0.019 |
| 3/26/15 | 0.02 |
| 3/27/15 | 0.02 |
| 3/30/15 | 0.02 |
| 3/31/15 | 0.019 |
| 4/1/15 | 0.019 |
| 4/2/15 | 0.019 |
| 4/3/15 | 0.019 |
| 4/6/15 | 0.019 |
| 4/7/15 | 0.019 |
| 4/8/15 | 0.019 |
| 4/9/15 | 0.02 |
| 4/10/15 | 0.02 |
| 4/13/15 | 0.019 |
| 4/14/15 | 0.019 |
| 4/15/15 | 0.019 |
| 4/16/15 | 0.019 |
| 4/17/15 | 0.019 |
| 4/20/15 | 0.019 |
| 4/21/15 | 0.019 |
| 4/22/15 | 0.02 |
| 4/23/15 | 0.02 |
| 4/24/15 | 0.019 |
| 4/27/15 | 0.019 |
| 4/28/15 | 0.02 |
| 4/29/15 | 0.021 |
| 4/30/15 | 0.02 |
| 5/1/15 | 0.021 |
| 5/4/15 | 0.022 |
| 5/5/15 | 0.022 |
| 5/6/15 | 0.022 |
| 5/7/15 | 0.022 |
| 5/8/15 | 0.022 |
| 5/11/15 | 0.023 |
| 5/12/15 | 0.023 |
| 5/13/15 | 0.023 |
| 5/14/15 | 0.022 |
| 5/15/15 | 0.021 |
| 5/18/15 | 0.022 |
| 5/19/15 | 0.023 |
| 5/20/15 | 0.023 |
| 5/21/15 | 0.022 |
| 5/22/15 | 0.022 |
| 5/25/15 | 0.022 |
| 5/26/15 | 0.021 |
| 5/27/15 | 0.021 |
| 5/28/15 | 0.021 |
| 5/29/15 | 0.021 |
| 6/1/15 | 0.022 |
| 6/2/15 | 0.023 |
| 6/3/15 | 0.024 |
| 6/4/15 | 0.023 |
| 6/5/15 | 0.024 |
| 6/8/15 | 0.024 |
| 6/9/15 | 0.024 |
| 6/10/15 | 0.025 |
| 6/11/15 | 0.024 |
| 6/12/15 | 0.024 |
| 6/15/15 | 0.024 |
| 6/16/15 | 0.023 |
| 6/17/15 | 0.023 |
| 6/18/15 | 0.024 |
| 6/19/15 | 0.023 |
| 6/22/15 | 0.024 |
| 6/23/15 | 0.024 |
| 6/24/15 | 0.024 |
| 6/25/15 | 0.024 |
| 6/26/15 | 0.025 |
| 6/29/15 | 0.023 |
| 6/30/15 | 0.024 |
| 7/1/15 | 0.024 |
| 7/2/15 | 0.024 |
| 7/3/15 | 0.024 |
| 7/6/15 | 0.023 |
| 7/7/15 | 0.023 |
| 7/8/15 | 0.022 |
| 7/9/15 | 0.023 |
| 7/10/15 | 0.024 |
| 7/13/15 | 0.024 |
| 7/14/15 | 0.024 |
| 7/15/15 | 0.024 |
| 7/16/15 | 0.024 |
| 7/17/15 | 0.023 |
| 7/20/15 | 0.024 |
| 7/21/15 | 0.024 |
| 7/22/15 | 0.023 |
| 7/23/15 | 0.023 |
| 7/24/15 | 0.023 |
| 7/27/15 | 0.022 |
| 7/28/15 | 0.023 |
| 7/29/15 | 0.023 |
| 7/30/15 | 0.023 |
| 7/31/15 | 0.022 |
| 8/3/15 | 0.022 |
| 8/4/15 | 0.022 |
| 8/5/15 | 0.023 |
| 8/6/15 | 0.022 |
| 8/7/15 | 0.022 |
| 8/10/15 | 0.022 |
| 8/11/15 | 0.022 |
| 8/12/15 | 0.021 |
| 8/13/15 | 0.022 |
| 8/14/15 | 0.022 |
| 8/17/15 | 0.022 |
| 8/18/15 | 0.022 |
| 8/19/15 | 0.021 |
| 8/20/15 | 0.021 |
| 8/21/15 | 0.02 |
| 8/24/15 | 0.02 |
| 8/25/15 | 0.021 |
| 8/26/15 | 0.022 |
| 8/27/15 | 0.022 |
| 8/28/15 | 0.022 |
| 8/31/15 | 0.022 |
| 9/1/15 | 0.022 |
| 9/2/15 | 0.022 |
| 9/3/15 | 0.022 |
| 9/4/15 | 0.021 |
| 9/7/15 | 0.021 |
| 9/8/15 | 0.022 |
| 9/9/15 | 0.022 |
| 9/10/15 | 0.022 |
| 9/11/15 | 0.022 |
| 9/14/15 | 0.022 |
| 9/15/15 | 0.023 |
| 9/16/15 | 0.023 |
| 9/17/15 | 0.022 |
| 9/18/15 | 0.021 |
| 9/21/15 | 0.022 |
| 9/22/15 | 0.021 |
| 9/23/15 | 0.022 |
| 9/24/15 | 0.021 |
| 9/25/15 | 0.022 |
| 9/28/15 | 0.021 |
| 9/29/15 | 0.02 |
| 9/30/15 | 0.021 |
| 10/1/15 | 0.02 |
| 10/2/15 | 0.02 |
| 10/5/15 | 0.021 |
| 10/6/15 | 0.02 |
| 10/7/15 | 0.021 |
| 10/8/15 | 0.021 |
| 10/9/15 | 0.021 |
| 10/12/15 | 0.021 |
| 10/13/15 | 0.021 |
| 10/14/15 | 0.02 |
| 10/15/15 | 0.02 |
| 10/16/15 | 0.02 |
| 10/19/15 | 0.02 |
| 10/20/15 | 0.021 |
| 10/21/15 | 0.02 |
| 10/22/15 | 0.02 |
| 10/23/15 | 0.021 |
| 10/26/15 | 0.021 |
| 10/27/15 | 0.02 |
| 10/28/15 | 0.021 |
| 10/29/15 | 0.022 |
| 10/30/15 | 0.022 |
| 11/2/15 | 0.022 |
| 11/3/15 | 0.022 |
| 11/4/15 | 0.022 |
| 11/5/15 | 0.023 |
| 11/6/15 | 0.023 |
| 11/9/15 | 0.024 |
| 11/10/15 | 0.023 |
| 11/11/15 | 0.023 |
| 11/12/15 | 0.023 |
| 11/13/15 | 0.023 |
| 11/16/15 | 0.023 |
| 11/17/15 | 0.022 |
| 11/18/15 | 0.023 |
| 11/19/15 | 0.022 |
| 11/20/15 | 0.023 |
| 11/23/15 | 0.022 |
| 11/24/15 | 0.022 |
| 11/25/15 | 0.022 |
| 11/26/15 | 0.022 |
| 11/27/15 | 0.022 |
| 11/30/15 | 0.022 |
| 12/1/15 | 0.022 |
| 12/2/15 | 0.022 |
| 12/3/15 | 0.023 |
| 12/4/15 | 0.023 |
| 12/7/15 | 0.022 |
| 12/8/15 | 0.022 |
| 12/9/15 | 0.022 |
| 12/10/15 | 0.022 |
| 12/11/15 | 0.021 |
| 12/14/15 | 0.022 |
| 12/15/15 | 0.023 |
| 12/16/15 | 0.023 |
| 12/17/15 | 0.022 |
| 12/18/15 | 0.022 |
| 12/21/15 | 0.022 |
| 12/22/15 | 0.022 |
| 12/23/15 | 0.023 |
| 12/24/15 | 0.022 |
| 12/25/15 | 0.022 |
| 12/28/15 | 0.022 |
| 12/29/15 | 0.023 |
| 12/30/15 | 0.023 |
| 12/31/15 | 0.023 |
| 1/1/16 | 0.023 |
| 1/4/16 | 0.022 |
| 1/5/16 | 0.022 |
| 1/6/16 | 0.022 |
| 1/7/16 | 0.022 |
| 1/8/16 | 0.021 |
| 1/11/16 | 0.022 |
| 1/12/16 | 0.021 |
| 1/13/16 | 0.021 |
| 1/14/16 | 0.021 |
| 1/15/16 | 0.02 |
| 1/18/16 | 0.02 |
| 1/19/16 | 0.021 |
| 1/20/16 | 0.02 |
| 1/21/16 | 0.02 |
| 1/22/16 | 0.021 |
| 1/25/16 | 0.02 |
| 1/26/16 | 0.02 |
| 1/27/16 | 0.02 |
| 1/28/16 | 0.02 |
| 1/29/16 | 0.019 |
| 2/1/16 | 0.02 |
| 2/2/16 | 0.019 |
| 2/3/16 | 0.019 |
| 2/4/16 | 0.019 |
| 2/5/16 | 0.019 |
| 2/8/16 | 0.018 |
| 2/9/16 | 0.017 |
| 2/10/16 | 0.017 |
| 2/11/16 | 0.016 |
| 2/12/16 | 0.017 |
| 2/15/16 | 0.017 |
| 2/16/16 | 0.018 |
| 2/17/16 | 0.018 |
| 2/18/16 | 0.018 |
| 2/19/16 | 0.018 |
| 2/22/16 | 0.018 |
| 2/23/16 | 0.017 |
| 2/24/16 | 0.018 |
| 2/25/16 | 0.017 |
| 2/26/16 | 0.018 |
| 2/29/16 | 0.017 |
| 3/1/16 | 0.018 |
| 3/2/16 | 0.018 |
| 3/3/16 | 0.018 |
| 3/4/16 | 0.019 |
| 3/7/16 | 0.019 |
| 3/8/16 | 0.018 |
| 3/9/16 | 0.019 |
| 3/10/16 | 0.019 |
| 3/11/16 | 0.02 |
| 3/14/16 | 0.02 |
| 3/15/16 | 0.02 |
| 3/16/16 | 0.019 |
| 3/17/16 | 0.019 |
| 3/18/16 | 0.019 |
| 3/21/16 | 0.019 |
| 3/22/16 | 0.019 |
| 3/23/16 | 0.019 |
| 3/24/16 | 0.019 |
| 3/25/16 | 0.019 |
| 3/28/16 | 0.019 |
| 3/29/16 | 0.018 |
| 3/30/16 | 0.018 |
| 3/31/16 | 0.018 |
| 4/1/16 | 0.018 |
| 4/4/16 | 0.018 |
| 4/5/16 | 0.017 |
| 4/6/16 | 0.018 |
| 4/7/16 | 0.017 |
| 4/8/16 | 0.017 |
| 4/11/16 | 0.017 |
| 4/12/16 | 0.018 |
| 4/13/16 | 0.018 |
| 4/14/16 | 0.018 |
| 4/15/16 | 0.018 |
| 4/18/16 | 0.018 |
| 4/19/16 | 0.018 |
| 4/20/16 | 0.019 |
| 4/21/16 | 0.019 |
| 4/22/16 | 0.019 |
| 4/25/16 | 0.019 |
| 4/26/16 | 0.019 |
| 4/27/16 | 0.019 |
| 4/28/16 | 0.018 |
| 4/29/16 | 0.018 |
| 5/2/16 | 0.019 |
| 5/3/16 | 0.018 |
| 5/4/16 | 0.018 |
| 5/5/16 | 0.018 |
| 5/6/16 | 0.018 |
| 5/9/16 | 0.018 |
| 5/10/16 | 0.018 |
| 5/11/16 | 0.017 |
| 5/12/16 | 0.018 |
| 5/13/16 | 0.017 |
| 5/16/16 | 0.018 |
| 5/17/16 | 0.018 |
| 5/18/16 | 0.019 |
| 5/19/16 | 0.019 |
| 5/20/16 | 0.019 |
| 5/23/16 | 0.018 |
| 5/24/16 | 0.019 |
| 5/25/16 | 0.019 |
| 5/26/16 | 0.018 |
| 5/27/16 | 0.019 |
| 5/30/16 | 0.019 |
| 5/31/16 | 0.018 |
| 6/1/16 | 0.019 |
| 6/2/16 | 0.018 |
| 6/3/16 | 0.017 |
| 6/6/16 | 0.017 |
| 6/7/16 | 0.017 |
| 6/8/16 | 0.017 |
| 6/9/16 | 0.017 |
| 6/10/16 | 0.016 |
| 6/13/16 | 0.016 |
| 6/14/16 | 0.016 |
| 6/15/16 | 0.016 |
| 6/16/16 | 0.016 |
| 6/17/16 | 0.016 |
| 6/20/16 | 0.017 |
| 6/21/16 | 0.017 |
| 6/22/16 | 0.017 |
| 6/23/16 | 0.017 |
| 6/24/16 | 0.016 |
| 6/27/16 | 0.015 |
| 6/28/16 | 0.015 |
| 6/29/16 | 0.015 |
| 6/30/16 | 0.015 |
| 7/1/16 | 0.015 |
| 7/4/16 | 0.015 |
| 7/5/16 | 0.014 |
| 7/6/16 | 0.014 |
| 7/7/16 | 0.014 |
| 7/8/16 | 0.014 |
| 7/11/16 | 0.014 |
| 7/12/16 | 0.015 |
| 7/13/16 | 0.015 |
| 7/14/16 | 0.015 |
| 7/15/16 | 0.016 |
| 7/18/16 | 0.016 |
| 7/19/16 | 0.016 |
| 7/20/16 | 0.016 |
| 7/21/16 | 0.016 |
| 7/22/16 | 0.016 |
| 7/25/16 | 0.016 |
| 7/26/16 | 0.016 |
| 7/27/16 | 0.015 |
| 7/28/16 | 0.015 |
| 7/29/16 | 0.015 |
| 8/1/16 | 0.015 |
| 8/2/16 | 0.016 |
| 8/3/16 | 0.016 |
| 8/4/16 | 0.015 |
| 8/5/16 | 0.016 |
| 8/8/16 | 0.016 |
| 8/9/16 | 0.016 |
| 8/10/16 | 0.015 |
| 8/11/16 | 0.016 |
| 8/12/16 | 0.015 |
| 8/15/16 | 0.016 |
| 8/16/16 | 0.016 |
| 8/17/16 | 0.016 |
| 8/18/16 | 0.015 |
| 8/19/16 | 0.016 |
| 8/22/16 | 0.016 |
| 8/23/16 | 0.016 |
| 8/24/16 | 0.016 |
| 8/25/16 | 0.016 |
| 8/26/16 | 0.016 |
| 8/29/16 | 0.016 |
| 8/30/16 | 0.016 |
| 8/31/16 | 0.016 |
| 9/1/16 | 0.016 |
| 9/2/16 | 0.016 |
| 9/5/16 | 0.016 |
| 9/6/16 | 0.016 |
| 9/7/16 | 0.015 |
| 9/8/16 | 0.016 |
| 9/9/16 | 0.017 |
| 9/12/16 | 0.017 |
| 9/13/16 | 0.017 |
| 9/14/16 | 0.017 |
| 9/15/16 | 0.017 |
| 9/16/16 | 0.017 |
| 9/19/16 | 0.017 |
| 9/20/16 | 0.017 |
| 9/21/16 | 0.017 |
| 9/22/16 | 0.016 |
| 9/23/16 | 0.016 |
| 9/26/16 | 0.016 |
| 9/27/16 | 0.016 |
| 9/28/16 | 0.016 |
| 9/29/16 | 0.016 |
| 9/30/16 | 0.016 |
| 10/3/16 | 0.016 |
| 10/4/16 | 0.017 |
| 10/5/16 | 0.017 |
| 10/6/16 | 0.018 |
| 10/7/16 | 0.017 |
| 10/10/16 | 0.017 |
| 10/11/16 | 0.018 |
| 10/12/16 | 0.018 |
| 10/13/16 | 0.018 |
| 10/14/16 | 0.018 |
| 10/17/16 | 0.018 |
| 10/18/16 | 0.018 |
| 10/19/16 | 0.018 |
| 10/20/16 | 0.018 |
| 10/21/16 | 0.017 |
| 10/24/16 | 0.018 |
| 10/25/16 | 0.018 |
| 10/26/16 | 0.018 |
| 10/27/16 | 0.019 |
| 10/28/16 | 0.019 |
| 10/31/16 | 0.018 |
| 11/1/16 | 0.018 |
| 11/2/16 | 0.018 |
| 11/3/16 | 0.018 |
| 11/4/16 | 0.018 |
| 11/7/16 | 0.018 |
| 11/8/16 | 0.019 |
| 11/9/16 | 0.021 |
| 11/10/16 | 0.022 |
| 11/11/16 | 0.022 |
| 11/14/16 | 0.022 |
| 11/15/16 | 0.022 |
| 11/16/16 | 0.022 |
| 11/17/16 | 0.023 |
| 11/18/16 | 0.023 |
| 11/21/16 | 0.023 |
| 11/22/16 | 0.023 |
| 11/23/16 | 0.024 |
| 11/24/16 | 0.024 |
| 11/25/16 | 0.024 |
| 11/28/16 | 0.023 |
| 11/29/16 | 0.023 |
| 11/30/16 | 0.024 |
| 12/1/16 | 0.024 |
| 12/2/16 | 0.024 |
| 12/5/16 | 0.024 |
| 12/6/16 | 0.024 |
| 12/7/16 | 0.023 |
| 12/8/16 | 0.024 |
| 12/9/16 | 0.025 |
| 12/12/16 | 0.025 |
| 12/13/16 | 0.025 |
| 12/14/16 | 0.025 |
| 12/15/16 | 0.026 |
| 12/16/16 | 0.026 |
| 12/19/16 | 0.025 |
| 12/20/16 | 0.026 |
| 12/21/16 | 0.026 |
| 12/22/16 | 0.026 |
| 12/23/16 | 0.026 |
| 12/26/16 | 0.026 |
| 12/27/16 | 0.026 |
| 12/28/16 | 0.025 |
| 12/29/16 | 0.025 |
| 12/30/16 | 0.024 |
| 1/2/17 | 0.024 |
| 1/3/17 | 0.024 |
| 1/4/17 | 0.025 |
| 1/5/17 | 0.024 |
| 1/6/17 | 0.024 |
| 1/9/17 | 0.024 |
| 1/10/17 | 0.024 |
| 1/11/17 | 0.024 |
| 1/12/17 | 0.024 |
| 1/13/17 | 0.024 |
| 1/16/17 | 0.024 |
| 1/17/17 | 0.023 |
| 1/18/17 | 0.024 |
| 1/19/17 | 0.025 |
| 1/20/17 | 0.025 |
| 1/23/17 | 0.024 |
| 1/24/17 | 0.025 |
| 1/25/17 | 0.025 |
| 1/26/17 | 0.025 |
| 1/27/17 | 0.025 |
| 1/30/17 | 0.025 |
| 1/31/17 | 0.024 |
| 2/1/17 | 0.025 |
| 2/2/17 | 0.025 |
| 2/3/17 | 0.025 |
| 2/6/17 | 0.024 |
| 2/7/17 | 0.024 |
| 2/8/17 | 0.023 |
| 2/9/17 | 0.024 |
| 2/10/17 | 0.024 |
| 2/13/17 | 0.024 |
| 2/14/17 | 0.025 |
| 2/15/17 | 0.025 |
| 2/16/17 | 0.024 |
| 2/17/17 | 0.024 |
| 2/20/17 | 0.024 |
| 2/21/17 | 0.024 |
| 2/22/17 | 0.024 |
| 2/23/17 | 0.024 |
| 2/24/17 | 0.023 |
| 2/27/17 | 0.024 |
| 2/28/17 | 0.024 |
| 3/1/17 | 0.025 |
| 3/2/17 | 0.025 |
| 3/3/17 | 0.025 |
| 3/6/17 | 0.025 |
| 3/7/17 | 0.025 |
| 3/8/17 | 0.026 |
| 3/9/17 | 0.026 |
| 3/10/17 | 0.026 |
| 3/13/17 | 0.026 |
| 3/14/17 | 0.026 |
| 3/15/17 | 0.025 |
| 3/16/17 | 0.025 |
| 3/17/17 | 0.025 |
| 3/20/17 | 0.025 |
| 3/21/17 | 0.024 |
| 3/22/17 | 0.024 |
| 3/23/17 | 0.024 |
| 3/24/17 | 0.024 |
| 3/27/17 | 0.024 |
| 3/28/17 | 0.024 |
| 3/29/17 | 0.024 |
| 3/30/17 | 0.024 |
| 3/31/17 | 0.024 |
| 4/3/17 | 0.024 |
| 4/4/17 | 0.024 |
| 4/5/17 | 0.023 |
| 4/6/17 | 0.023 |
| 4/7/17 | 0.024 |
| 4/10/17 | 0.024 |
| 4/11/17 | 0.023 |
| 4/12/17 | 0.023 |
| 4/13/17 | 0.022 |
| 4/14/17 | 0.022 |
| 4/17/17 | 0.023 |
| 4/18/17 | 0.022 |
| 4/19/17 | 0.022 |
| 4/20/17 | 0.022 |
| 4/21/17 | 0.022 |
| 4/24/17 | 0.023 |
| 4/25/17 | 0.024 |
| 4/26/17 | 0.023 |
| 4/27/17 | 0.023 |
| 4/28/17 | 0.023 |
| 5/1/17 | 0.023 |
| 5/2/17 | 0.023 |
| 5/3/17 | 0.023 |
| 5/4/17 | 0.024 |
| 5/5/17 | 0.024 |
| 5/8/17 | 0.024 |
| 5/9/17 | 0.024 |
| 5/10/17 | 0.024 |
| 5/11/17 | 0.024 |
| 5/12/17 | 0.023 |
| 5/15/17 | 0.023 |
| 5/16/17 | 0.023 |
| 5/17/17 | 0.022 |
| 5/18/17 | 0.022 |
| 5/19/17 | 0.022 |
| 5/22/17 | 0.022 |
| 5/23/17 | 0.023 |
| 5/24/17 | 0.023 |
| 5/25/17 | 0.022 |
| 5/26/17 | 0.022 |
| 5/29/17 | 0.022 |
| 5/30/17 | 0.022 |
| 5/31/17 | 0.022 |
| 6/1/17 | 0.022 |
| 6/2/17 | 0.022 |
| 6/5/17 | 0.022 |
| 6/6/17 | 0.021 |
| 6/7/17 | 0.022 |
| 6/8/17 | 0.022 |
| 6/9/17 | 0.022 |
| 6/12/17 | 0.022 |
| 6/13/17 | 0.022 |
| 6/14/17 | 0.022 |
| 6/15/17 | 0.022 |
| 6/16/17 | 0.022 |
| 6/19/17 | 0.022 |
| 6/20/17 | 0.022 |
| 6/21/17 | 0.022 |
| 6/22/17 | 0.022 |
| 6/23/17 | 0.022 |
| 6/26/17 | 0.021 |
| 6/27/17 | 0.022 |
| 6/28/17 | 0.022 |
| 6/29/17 | 0.023 |
| 6/30/17 | 0.023 |
| 7/3/17 | 0.024 |
| 7/4/17 | 0.024 |
| 7/5/17 | 0.023 |
| 7/6/17 | 0.024 |
| 7/7/17 | 0.024 |
| 7/10/17 | 0.024 |
| 7/11/17 | 0.024 |
| 7/12/17 | 0.023 |
| 7/13/17 | 0.024 |
| 7/14/17 | 0.023 |
| 7/17/17 | 0.023 |
| 7/18/17 | 0.023 |
| 7/19/17 | 0.023 |
| 7/20/17 | 0.023 |
| 7/21/17 | 0.022 |
| 7/24/17 | 0.023 |
| 7/25/17 | 0.023 |
| 7/26/17 | 0.023 |
| 7/27/17 | 0.023 |
| 7/28/17 | 0.023 |
| 7/31/17 | 0.023 |
| 8/1/17 | 0.023 |
| 8/2/17 | 0.023 |
| 8/3/17 | 0.022 |
| 8/4/17 | 0.023 |
| 8/7/17 | 0.023 |
| 8/8/17 | 0.023 |
| 8/9/17 | 0.022 |
| 8/10/17 | 0.022 |
| 8/11/17 | 0.022 |
| 8/14/17 | 0.022 |
| 8/15/17 | 0.023 |
| 8/16/17 | 0.022 |
| 8/17/17 | 0.022 |
| 8/18/17 | 0.022 |
| 8/21/17 | 0.022 |
| 8/22/17 | 0.022 |
| 8/23/17 | 0.022 |
| 8/24/17 | 0.022 |
| 8/25/17 | 0.022 |
| 8/28/17 | 0.022 |
| 8/29/17 | 0.021 |
| 8/30/17 | 0.022 |
| 8/31/17 | 0.021 |
| 9/1/17 | 0.022 |
| 9/4/17 | 0.022 |
| 9/5/17 | 0.021 |
| 9/6/17 | 0.021 |
| 9/7/17 | 0.02 |
| 9/8/17 | 0.021 |
| 9/11/17 | 0.021 |
| 9/12/17 | 0.022 |
| 9/13/17 | 0.022 |
| 9/14/17 | 0.022 |
| 9/15/17 | 0.022 |
| 9/18/17 | 0.022 |
| 9/19/17 | 0.022 |
| 9/20/17 | 0.023 |
| 9/21/17 | 0.023 |
| 9/22/17 | 0.023 |
| 9/25/17 | 0.022 |
| 9/26/17 | 0.022 |
| 9/27/17 | 0.023 |
| 9/28/17 | 0.023 |
| 9/29/17 | 0.023 |
| 10/2/17 | 0.023 |
| 10/3/17 | 0.023 |
| 10/4/17 | 0.023 |
| 10/5/17 | 0.024 |
| 10/6/17 | 0.024 |
| 10/9/17 | 0.024 |
| 10/10/17 | 0.024 |
| 10/11/17 | 0.024 |
| 10/12/17 | 0.023 |
| 10/13/17 | 0.023 |
| 10/16/17 | 0.023 |
| 10/17/17 | 0.023 |
| 10/18/17 | 0.023 |
| 10/19/17 | 0.023 |
| 10/20/17 | 0.024 |
| 10/23/17 | 0.024 |
| 10/24/17 | 0.024 |
| 10/25/17 | 0.024 |
| 10/26/17 | 0.025 |
| 10/27/17 | 0.024 |
| 10/30/17 | 0.024 |
| 10/31/17 | 0.024 |
| 11/1/17 | 0.024 |
| 11/2/17 | 0.024 |
| 11/3/17 | 0.023 |
| 11/6/17 | 0.023 |
| 11/7/17 | 0.023 |
| 11/8/17 | 0.023 |
| 11/9/17 | 0.023 |
| 11/10/17 | 0.024 |
| 11/13/17 | 0.024 |
| 11/14/17 | 0.024 |
| 11/15/17 | 0.023 |
| 11/16/17 | 0.024 |
| 11/17/17 | 0.024 |
| 11/20/17 | 0.024 |
| 11/21/17 | 0.024 |
| 11/22/17 | 0.023 |
| 11/23/17 | 0.023 |
| 11/24/17 | 0.023 |
| 11/27/17 | 0.023 |
| 11/28/17 | 0.023 |
| 11/29/17 | 0.024 |
| 11/30/17 | 0.024 |
| 12/1/17 | 0.024 |
| 12/4/17 | 0.024 |
| 12/5/17 | 0.024 |
| 12/6/17 | 0.023 |
| 12/7/17 | 0.024 |
| 12/8/17 | 0.024 |
| 12/11/17 | 0.024 |
| 12/12/17 | 0.024 |
| 12/13/17 | 0.024 |
| 12/14/17 | 0.024 |
| 12/15/17 | 0.024 |
| 12/18/17 | 0.024 |
| 12/19/17 | 0.025 |
| 12/20/17 | 0.025 |
| 12/21/17 | 0.025 |
| 12/22/17 | 0.025 |
| 12/25/17 | 0.025 |
| 12/26/17 | 0.025 |
| 12/27/17 | 0.024 |
| 12/28/17 | 0.024 |
| 12/29/17 | 0.024 |
| 1/1/18 | 0.024 |
| 1/2/18 | 0.025 |
| 1/3/18 | 0.024 |
| 1/4/18 | 0.025 |
| 1/5/18 | 0.025 |
| 1/8/18 | 0.025 |
| 1/9/18 | 0.026 |
| 1/10/18 | 0.026 |
| 1/11/18 | 0.025 |
| 1/12/18 | 0.026 |
| 1/15/18 | 0.026 |
| 1/16/18 | 0.025 |
| 1/17/18 | 0.026 |
| 1/18/18 | 0.026 |
| 1/19/18 | 0.026 |
| 1/22/18 | 0.027 |
| 1/23/18 | 0.026 |
| 1/24/18 | 0.026 |
| 1/25/18 | 0.026 |
| 1/26/18 | 0.027 |
| 1/29/18 | 0.027 |
| 1/30/18 | 0.027 |
| 1/31/18 | 0.027 |
| 2/1/18 | 0.028 |
| 2/2/18 | 0.028 |
| 2/5/18 | 0.028 |
| 2/6/18 | 0.028 |
| 2/7/18 | 0.028 |
| 2/8/18 | 0.028 |
| 2/9/18 | 0.028 |
| 2/12/18 | 0.029 |
| 2/13/18 | 0.028 |
| 2/14/18 | 0.029 |
| 2/15/18 | 0.029 |
| 2/16/18 | 0.029 |
| 2/19/18 | 0.029 |
| 2/20/18 | 0.029 |
| 2/21/18 | 0.029 |
| 2/22/18 | 0.029 |
| 2/23/18 | 0.029 |
| 2/26/18 | 0.029 |
| 2/27/18 | 0.029 |
| 2/28/18 | 0.029 |
| 3/1/18 | 0.028 |
| 3/2/18 | 0.029 |
| 3/5/18 | 0.029 |
| 3/6/18 | 0.029 |
| 3/7/18 | 0.029 |
| 3/8/18 | 0.029 |
| 3/9/18 | 0.029 |
| 3/12/18 | 0.029 |
| 3/13/18 | 0.028 |
| 3/14/18 | 0.028 |
| 3/15/18 | 0.028 |
| 3/16/18 | 0.028 |
| 3/19/18 | 0.028 |
| 3/20/18 | 0.029 |
| 3/21/18 | 0.029 |
| 3/22/18 | 0.028 |
| 3/23/18 | 0.028 |
| 3/26/18 | 0.028 |
| 3/27/18 | 0.028 |
| 3/28/18 | 0.028 |
| 3/29/18 | 0.027 |
| 3/30/18 | 0.027 |
| 4/2/18 | 0.027 |
| 4/3/18 | 0.028 |
| 4/4/18 | 0.028 |
| 4/5/18 | 0.028 |
| 4/6/18 | 0.028 |
| 4/9/18 | 0.028 |
| 4/10/18 | 0.028 |
| 4/11/18 | 0.028 |
| 4/12/18 | 0.028 |
| 4/13/18 | 0.028 |
| 4/16/18 | 0.028 |
| 4/17/18 | 0.028 |
| 4/18/18 | 0.029 |
| 4/19/18 | 0.029 |
| 4/20/18 | 0.03 |
| 4/23/18 | 0.03 |
| 4/24/18 | 0.03 |
| 4/25/18 | 0.03 |
| 4/26/18 | 0.03 |
| 4/27/18 | 0.03 |
| 4/30/18 | 0.03 |
| 5/1/18 | 0.03 |
| 5/2/18 | 0.03 |
| 5/3/18 | 0.029 |
| 5/4/18 | 0.03 |
| 5/7/18 | 0.03 |
| 5/8/18 | 0.03 |
| 5/9/18 | 0.03 |
| 5/10/18 | 0.03 |
| 5/11/18 | 0.03 |
| 5/14/18 | 0.03 |
| 5/15/18 | 0.031 |
| 5/16/18 | 0.031 |
| 5/17/18 | 0.031 |
| 5/18/18 | 0.031 |
| 5/21/18 | 0.031 |
| 5/22/18 | 0.031 |
| 5/23/18 | 0.03 |
| 5/24/18 | 0.03 |
| 5/25/18 | 0.029 |
| 5/28/18 | 0.029 |
| 5/29/18 | 0.028 |
| 5/30/18 | 0.028 |
| 5/31/18 | 0.028 |
| 6/1/18 | 0.029 |
| 6/4/18 | 0.029 |
| 6/5/18 | 0.029 |
| 6/6/18 | 0.03 |
| 6/7/18 | 0.029 |
| 6/8/18 | 0.029 |
| 6/11/18 | 0.03 |
| 6/12/18 | 0.03 |
| 6/13/18 | 0.03 |
| 6/14/18 | 0.029 |
| 6/15/18 | 0.029 |
| 6/18/18 | 0.029 |
| 6/19/18 | 0.029 |
| 6/20/18 | 0.029 |
| 6/21/18 | 0.029 |
| 6/22/18 | 0.029 |
| 6/25/18 | 0.029 |
| 6/26/18 | 0.029 |
| 6/27/18 | 0.028 |
| 6/28/18 | 0.028 |
| 6/29/18 | 0.028 |
| 7/2/18 | 0.029 |
| 7/3/18 | 0.028 |
| 7/4/18 | 0.028 |
| 7/5/18 | 0.028 |
| 7/6/18 | 0.028 |
| 7/9/18 | 0.029 |
| 7/10/18 | 0.029 |
| 7/11/18 | 0.028 |
| 7/12/18 | 0.028 |
| 7/13/18 | 0.028 |
| 7/16/18 | 0.028 |
| 7/17/18 | 0.029 |
| 7/18/18 | 0.029 |
| 7/19/18 | 0.028 |
| 7/20/18 | 0.029 |
| 7/23/18 | 0.03 |
| 7/24/18 | 0.03 |
| 7/25/18 | 0.029 |
| 7/26/18 | 0.03 |
| 7/27/18 | 0.03 |
| 7/30/18 | 0.03 |
| 7/31/18 | 0.03 |
| 8/1/18 | 0.03 |
| 8/2/18 | 0.03 |
| 8/3/18 | 0.03 |
| 8/6/18 | 0.029 |
| 8/7/18 | 0.03 |
| 8/8/18 | 0.03 |
| 8/9/18 | 0.029 |
| 8/10/18 | 0.029 |
| 8/13/18 | 0.029 |
| 8/14/18 | 0.029 |
| 8/15/18 | 0.029 |
| 8/16/18 | 0.029 |
| 8/17/18 | 0.029 |
| 8/20/18 | 0.028 |
| 8/21/18 | 0.028 |
| 8/22/18 | 0.028 |
| 8/23/18 | 0.028 |
| 8/24/18 | 0.028 |
| 8/27/18 | 0.028 |
| 8/28/18 | 0.029 |
| 8/29/18 | 0.029 |
| 8/30/18 | 0.029 |
| 8/31/18 | 0.029 |
| 9/3/18 | 0.029 |
| 9/4/18 | 0.029 |
| 9/5/18 | 0.029 |
| 9/6/18 | 0.029 |
| 9/7/18 | 0.029 |
| 9/10/18 | 0.029 |
| 9/11/18 | 0.03 |
| 9/12/18 | 0.03 |
| 9/13/18 | 0.03 |
| 9/14/18 | 0.03 |
| 9/17/18 | 0.03 |
| 9/18/18 | 0.03 |
| 9/19/18 | 0.031 |
| 9/20/18 | 0.031 |
| 9/21/18 | 0.031 |
| 9/24/18 | 0.031 |
| 9/25/18 | 0.031 |
| 9/26/18 | 0.031 |
| 9/27/18 | 0.031 |
| 9/28/18 | 0.03 |
| 10/1/18 | 0.031 |
| 10/2/18 | 0.03 |
| 10/3/18 | 0.032 |
| 10/4/18 | 0.032 |
| 10/5/18 | 0.032 |
| 10/8/18 | 0.032 |
| 10/9/18 | 0.032 |
| 10/10/18 | 0.032 |
| 10/11/18 | 0.031 |
| 10/12/18 | 0.032 |
| 10/15/18 | 0.032 |
| 10/16/18 | 0.032 |
| 10/17/18 | 0.032 |
| 10/18/18 | 0.032 |
| 10/19/18 | 0.032 |
| 10/22/18 | 0.032 |
| 10/23/18 | 0.032 |
| 10/24/18 | 0.031 |
| 10/25/18 | 0.031 |
| 10/26/18 | 0.031 |
| 10/29/18 | 0.031 |
| 10/30/18 | 0.031 |
| 10/31/18 | 0.032 |
| 11/1/18 | 0.031 |
| 11/2/18 | 0.032 |
| 11/5/18 | 0.032 |
| 11/6/18 | 0.032 |
| 11/7/18 | 0.032 |
| 11/8/18 | 0.032 |
| 11/9/18 | 0.032 |
| 11/12/18 | 0.032 |
| 11/13/18 | 0.031 |
| 11/14/18 | 0.031 |
| 11/15/18 | 0.031 |
| 11/16/18 | 0.031 |
| 11/19/18 | 0.031 |
| 11/20/18 | 0.031 |
| 11/21/18 | 0.031 |
| 11/22/18 | 0.031 |
| 11/23/18 | 0.03 |
| 11/26/18 | 0.031 |
| 11/27/18 | 0.031 |
| 11/28/18 | 0.031 |
| 11/29/18 | 0.03 |
| 11/30/18 | 0.03 |
| 12/3/18 | 0.03 |
| 12/4/18 | 0.029 |
| 12/5/18 | 0.029 |
| 12/6/18 | 0.029 |
| 12/7/18 | 0.028 |
| 12/10/18 | 0.028 |
| 12/11/18 | 0.029 |
| 12/12/18 | 0.029 |
| 12/13/18 | 0.029 |
| 12/14/18 | 0.029 |
| 12/17/18 | 0.029 |
| 12/18/18 | 0.028 |
| 12/19/18 | 0.028 |
| 12/20/18 | 0.028 |
| 12/21/18 | 0.028 |
| 12/24/18 | 0.027 |
| 12/25/18 | 0.027 |
| 12/26/18 | 0.028 |
| 12/27/18 | 0.028 |
| 12/28/18 | 0.027 |
| 12/31/18 | 0.027 |
| 1/1/19 | 0.027 |
| 1/2/19 | 0.027 |
| 1/3/19 | 0.026 |
| 1/4/19 | 0.027 |
| 1/7/19 | 0.027 |
| 1/8/19 | 0.027 |
| 1/9/19 | 0.027 |
| 1/10/19 | 0.027 |
| 1/11/19 | 0.027 |
| 1/14/19 | 0.027 |
| 1/15/19 | 0.027 |
| 1/16/19 | 0.027 |
| 1/17/19 | 0.028 |
| 1/18/19 | 0.028 |
| 1/21/19 | 0.028 |
| 1/22/19 | 0.027 |
| 1/23/19 | 0.028 |
| 1/24/19 | 0.027 |
| 1/25/19 | 0.028 |
| 1/28/19 | 0.028 |
| 1/29/19 | 0.027 |
| 1/30/19 | 0.027 |
| 1/31/19 | 0.026 |
| 2/1/19 | 0.027 |
| 2/4/19 | 0.027 |
| 2/5/19 | 0.027 |
| 2/6/19 | 0.027 |
| 2/7/19 | 0.026 |
| 2/8/19 | 0.026 |
| 2/11/19 | 0.026 |
| 2/12/19 | 0.027 |
| 2/13/19 | 0.027 |
| 2/14/19 | 0.027 |
| 2/15/19 | 0.027 |
| 2/18/19 | 0.027 |
| 2/19/19 | 0.026 |
| 2/20/19 | 0.026 |
| 2/21/19 | 0.027 |
| 2/22/19 | 0.026 |
| 2/25/19 | 0.027 |
| 2/26/19 | 0.026 |
| 2/27/19 | 0.027 |
| 2/28/19 | 0.027 |
| 3/1/19 | 0.028 |
| 3/4/19 | 0.027 |
| 3/5/19 | 0.027 |
| 3/6/19 | 0.027 |
| 3/7/19 | 0.026 |
| 3/8/19 | 0.026 |
| 3/11/19 | 0.026 |
| 3/12/19 | 0.026 |
| 3/13/19 | 0.026 |
| 3/14/19 | 0.026 |
| 3/15/19 | 0.026 |
| 3/18/19 | 0.026 |
| 3/19/19 | 0.026 |
| 3/20/19 | 0.025 |
| 3/21/19 | 0.025 |
| 3/22/19 | 0.024 |
| 3/25/19 | 0.024 |
| 3/26/19 | 0.024 |
| 3/27/19 | 0.024 |
| 3/28/19 | 0.024 |
| 3/29/19 | 0.024 |
| 4/1/19 | 0.025 |
| 4/2/19 | 0.025 |
| 4/3/19 | 0.025 |
| 4/4/19 | 0.025 |
| 4/5/19 | 0.025 |
| 4/8/19 | 0.025 |
| 4/9/19 | 0.025 |
| 4/10/19 | 0.025 |
| 4/11/19 | 0.025 |
| 4/12/19 | 0.026 |
| 4/15/19 | 0.026 |
| 4/16/19 | 0.026 |
| 4/17/19 | 0.026 |
| 4/18/19 | 0.026 |
| 4/19/19 | 0.026 |
| 4/22/19 | 0.026 |
| 4/23/19 | 0.026 |
| 4/24/19 | 0.025 |
| 4/25/19 | 0.025 |
| 4/26/19 | 0.025 |
| 4/29/19 | 0.025 |
| 4/30/19 | 0.025 |
| 5/1/19 | 0.025 |
| 5/2/19 | 0.026 |
| 5/3/19 | 0.025 |
| 5/6/19 | 0.025 |
| 5/7/19 | 0.024 |
| 5/8/19 | 0.025 |
| 5/9/19 | 0.024 |
| 5/10/19 | 0.025 |
| 5/13/19 | 0.024 |
| 5/14/19 | 0.024 |
| 5/15/19 | 0.024 |
| 5/16/19 | 0.024 |
| 5/17/19 | 0.024 |
| 5/20/19 | 0.024 |
| 5/21/19 | 0.024 |
| 5/22/19 | 0.024 |
| 5/23/19 | 0.023 |
| 5/24/19 | 0.023 |
| 5/27/19 | 0.023 |
| 5/28/19 | 0.023 |
| 5/29/19 | 0.022 |
| 5/30/19 | 0.022 |
| 5/31/19 | 0.021 |
| 6/3/19 | 0.021 |
| 6/4/19 | 0.021 |
| 6/5/19 | 0.021 |
| 6/6/19 | 0.021 |
| 6/7/19 | 0.021 |
| 6/10/19 | 0.022 |
| 6/11/19 | 0.022 |
| 6/12/19 | 0.021 |
| 6/13/19 | 0.021 |
| 6/14/19 | 0.021 |
| 6/17/19 | 0.021 |
| 6/18/19 | 0.021 |
| 6/19/19 | 0.02 |
| 6/20/19 | 0.02 |
| 6/21/19 | 0.021 |
| 6/24/19 | 0.02 |
| 6/25/19 | 0.02 |
| 6/26/19 | 0.02 |
| 6/27/19 | 0.02 |
| 6/28/19 | 0.02 |
| 7/1/19 | 0.02 |
| 7/2/19 | 0.02 |
| 7/3/19 | 0.02 |
| 7/4/19 | 0.02 |
| 7/5/19 | 0.02 |
| 7/8/19 | 0.02 |
| 7/9/19 | 0.021 |
| 7/10/19 | 0.021 |
| 7/11/19 | 0.021 |
| 7/12/19 | 0.021 |
| 7/15/19 | 0.021 |
| 7/16/19 | 0.021 |
| 7/17/19 | 0.021 |
| 7/18/19 | 0.02 |
| 7/19/19 | 0.02 |
| 7/22/19 | 0.02 |
| 7/23/19 | 0.021 |
| 7/24/19 | 0.02 |
| 7/25/19 | 0.021 |
| 7/26/19 | 0.021 |
| 7/29/19 | 0.021 |
| 7/30/19 | 0.021 |
| 7/31/19 | 0.02 |
| 8/1/19 | 0.019 |
| 8/2/19 | 0.019 |
| 8/5/19 | 0.018 |
| 8/6/19 | 0.017 |
| 8/7/19 | 0.017 |
| 8/8/19 | 0.017 |
| 8/9/19 | 0.017 |
| 8/12/19 | 0.016 |
| 8/13/19 | 0.017 |
| 8/14/19 | 0.016 |
| 8/15/19 | 0.015 |
| 8/16/19 | 0.016 |
| 8/19/19 | 0.016 |
| 8/20/19 | 0.016 |
| 8/21/19 | 0.016 |
| 8/22/19 | 0.016 |
| 8/23/19 | 0.015 |
| 8/26/19 | 0.015 |
| 8/27/19 | 0.015 |
| 8/28/19 | 0.015 |
| 8/29/19 | 0.015 |
| 8/30/19 | 0.015 |
| 9/2/19 | 0.015 |
| 9/3/19 | 0.015 |
| 9/4/19 | 0.015 |
| 9/5/19 | 0.016 |
| 9/6/19 | 0.016 |
| 9/9/19 | 0.016 |
| 9/10/19 | 0.017 |
| 9/11/19 | 0.018 |
| 9/12/19 | 0.018 |
| 9/13/19 | 0.019 |
| 9/16/19 | 0.018 |
| 9/17/19 | 0.018 |
| 9/18/19 | 0.018 |
| 9/19/19 | 0.018 |
| 9/20/19 | 0.017 |
| 9/23/19 | 0.017 |
| 9/24/19 | 0.016 |
| 9/25/19 | 0.017 |
| 9/26/19 | 0.017 |
| 9/27/19 | 0.017 |
| 9/30/19 | 0.017 |
| 10/1/19 | 0.016 |
| 10/2/19 | 0.016 |
| 10/3/19 | 0.015 |
| 10/4/19 | 0.015 |
| 10/7/19 | 0.016 |
| 10/8/19 | 0.015 |
| 10/9/19 | 0.016 |
| 10/10/19 | 0.017 |
| 10/11/19 | 0.018 |
| 10/14/19 | 0.018 |
| 10/15/19 | 0.018 |
| 10/16/19 | 0.018 |
| 10/17/19 | 0.018 |
| 10/18/19 | 0.018 |
| 10/21/19 | 0.018 |
| 10/22/19 | 0.018 |
| 10/23/19 | 0.018 |
| 10/24/19 | 0.018 |
| 10/25/19 | 0.018 |
| 10/28/19 | 0.019 |
| 10/29/19 | 0.018 |
| 10/30/19 | 0.018 |
| 10/31/19 | 0.017 |
| 11/1/19 | 0.017 |
| 11/4/19 | 0.018 |
| 11/5/19 | 0.019 |
| 11/6/19 | 0.018 |
| 11/7/19 | 0.019 |
| 11/8/19 | 0.019 |
| 11/11/19 | 0.019 |
| 11/12/19 | 0.019 |
| 11/13/19 | 0.019 |
| 11/14/19 | 0.018 |
| 11/15/19 | 0.018 |
| 11/18/19 | 0.018 |
| 11/19/19 | 0.018 |
| 11/20/19 | 0.017 |
| 11/21/19 | 0.018 |
| 11/22/19 | 0.018 |
| 11/25/19 | 0.018 |
| 11/26/19 | 0.017 |
| 11/27/19 | 0.018 |
| 11/28/19 | 0.018 |
| 11/29/19 | 0.018 |
| 12/2/19 | 0.018 |
| 12/3/19 | 0.017 |
| 12/4/19 | 0.018 |
| 12/5/19 | 0.018 |
| 12/6/19 | 0.018 |
| 12/9/19 | 0.018 |
| 12/10/19 | 0.019 |
| 12/11/19 | 0.018 |
| 12/12/19 | 0.019 |
| 12/13/19 | 0.018 |
| 12/16/19 | 0.019 |
| 12/17/19 | 0.019 |
| 12/18/19 | 0.019 |
| 12/19/19 | 0.019 |
| 12/20/19 | 0.019 |
| 12/23/19 | 0.019 |
| 12/24/19 | 0.019 |
| 12/25/19 | 0.019 |
| 12/26/19 | 0.019 |
| 12/27/19 | 0.019 |
| 12/30/19 | 0.019 |
| 12/31/19 | 0.019 |
| 1/1/20 | 0.019 |
| 1/2/20 | 0.019 |
| 1/3/20 | 0.018 |
| 1/6/20 | 0.018 |
| 1/7/20 | 0.018 |
| 1/8/20 | 0.019 |
| 1/9/20 | 0.019 |
| 1/10/20 | 0.018 |
| 1/13/20 | 0.019 |
| 1/14/20 | 0.018 |
| 1/15/20 | 0.018 |
| 1/16/20 | 0.018 |
| 1/17/20 | 0.018 |
| 1/20/20 | 0.018 |
| 1/21/20 | 0.018 |
| 1/22/20 | 0.018 |
| 1/23/20 | 0.017 |
| 1/24/20 | 0.017 |
| 1/27/20 | 0.016 |
| 1/28/20 | 0.016 |
| 1/29/20 | 0.016 |
| 1/30/20 | 0.016 |
| 1/31/20 | 0.015 |
| 2/3/20 | 0.015 |
| 2/4/20 | 0.016 |
| 2/5/20 | 0.017 |
| 2/6/20 | 0.016 |
| 2/7/20 | 0.016 |
| 2/10/20 | 0.016 |
| 2/11/20 | 0.016 |
| 2/12/20 | 0.016 |
| 2/13/20 | 0.016 |
| 2/14/20 | 0.016 |
| 2/17/20 | 0.016 |
| 2/18/20 | 0.016 |
| 2/19/20 | 0.016 |
| 2/20/20 | 0.015 |
| 2/21/20 | 0.015 |
| 2/24/20 | 0.014 |
| 2/25/20 | 0.013 |
| 2/26/20 | 0.013 |
| 2/27/20 | 0.013 |
| 2/28/20 | 0.011 |
| 3/2/20 | 0.011 |
| 3/3/20 | 0.01 |
| 3/4/20 | 0.01 |
| 3/5/20 | 0.009 |
| 3/6/20 | 0.007 |
| 3/9/20 | 0.005 |
| 3/10/20 | 0.008 |
| 3/11/20 | 0.008 |
| 3/12/20 | 0.009 |
| 3/13/20 | 0.009 |
| 3/16/20 | 0.007 |
| 3/17/20 | 0.01 |
| 3/18/20 | 0.012 |
| 3/19/20 | 0.011 |
| 3/20/20 | 0.009 |
| 3/23/20 | 0.008 |
| 3/24/20 | 0.008 |
| 3/25/20 | 0.009 |
| 3/26/20 | 0.008 |
| 3/27/20 | 0.007 |
| 3/30/20 | 0.007 |
| 3/31/20 | 0.007 |
| 4/1/20 | 0.006 |
| 4/2/20 | 0.006 |
| 4/3/20 | 0.006 |
| 4/6/20 | 0.007 |
| 4/7/20 | 0.008 |
| 4/8/20 | 0.008 |
| 4/9/20 | 0.007 |
| 4/10/20 | 0.007 |
| 4/13/20 | 0.008 |
| 4/14/20 | 0.008 |
| 4/15/20 | 0.006 |
| 4/16/20 | 0.006 |
| 4/17/20 | 0.007 |
| 4/20/20 | 0.006 |
| 4/21/20 | 0.006 |
| 4/22/20 | 0.006 |
| 4/23/20 | 0.006 |
| 4/24/20 | 0.006 |
| 4/27/20 | 0.007 |
| 4/28/20 | 0.006 |
| 4/29/20 | 0.006 |
| 4/30/20 | 0.006 |
| 5/1/20 | 0.006 |
| 5/4/20 | 0.006 |
| 5/5/20 | 0.007 |
| 5/6/20 | 0.007 |
| 5/7/20 | 0.006 |
| 5/8/20 | 0.007 |
| 5/11/20 | 0.007 |
| 5/12/20 | 0.007 |
| 5/13/20 | 0.006 |
| 5/14/20 | 0.006 |
| 5/15/20 | 0.006 |
| 5/18/20 | 0.007 |
| 5/19/20 | 0.007 |
| 5/20/20 | 0.007 |
| 5/21/20 | 0.007 |
| 5/22/20 | 0.007 |
| 5/25/20 | 0.007 |
| 5/26/20 | 0.007 |
| 5/27/20 | 0.007 |
| 5/28/20 | 0.007 |
| 5/29/20 | 0.007 |
| 6/1/20 | 0.007 |
| 6/2/20 | 0.007 |
| 6/3/20 | 0.008 |
| 6/4/20 | 0.008 |
| 6/5/20 | 0.009 |
| 6/8/20 | 0.009 |
| 6/9/20 | 0.008 |
| 6/10/20 | 0.008 |
| 6/11/20 | 0.007 |
| 6/12/20 | 0.007 |
| 6/15/20 | 0.007 |
| 6/16/20 | 0.008 |
| 6/17/20 | 0.007 |
| 6/18/20 | 0.007 |
| 6/19/20 | 0.007 |
| 6/22/20 | 0.007 |
| 6/23/20 | 0.007 |
| 6/24/20 | 0.007 |
| 6/25/20 | 0.007 |
| 6/26/20 | 0.006 |
| 6/29/20 | 0.006 |
| 6/30/20 | 0.007 |
| 7/1/20 | 0.007 |
| 7/2/20 | 0.007 |
| 7/3/20 | 0.007 |
| 7/6/20 | 0.007 |
| 7/7/20 | 0.007 |
| 7/8/20 | 0.007 |
| 7/9/20 | 0.006 |
| 7/10/20 | 0.007 |
| 7/13/20 | 0.006 |
| 7/14/20 | 0.006 |
| 7/15/20 | 0.006 |
| 7/16/20 | 0.006 |
| 7/17/20 | 0.006 |
| 7/20/20 | 0.006 |
| 7/21/20 | 0.006 |
| 7/22/20 | 0.006 |
| 7/23/20 | 0.006 |
| 7/24/20 | 0.006 |
| 7/27/20 | 0.006 |
| 7/28/20 | 0.006 |
| 7/29/20 | 0.006 |
| 7/30/20 | 0.006 |
| 7/31/20 | 0.006 |
| 8/3/20 | 0.006 |
| 8/4/20 | 0.005 |
| 8/5/20 | 0.006 |
| 8/6/20 | 0.006 |
| 8/7/20 | 0.006 |
| 8/10/20 | 0.006 |
| 8/11/20 | 0.006 |
| 8/12/20 | 0.007 |
| 8/13/20 | 0.007 |
| 8/14/20 | 0.007 |
| 8/17/20 | 0.007 |
| 8/18/20 | 0.007 |
| 8/19/20 | 0.007 |
| 8/20/20 | 0.007 |
| 8/21/20 | 0.006 |
| 8/24/20 | 0.007 |
| 8/25/20 | 0.007 |
| 8/26/20 | 0.007 |
| 8/27/20 | 0.007 |
| 8/28/20 | 0.007 |
| 8/31/20 | 0.007 |
| 9/1/20 | 0.007 |
| 9/2/20 | 0.007 |
| 9/3/20 | 0.006 |
| 9/4/20 | 0.007 |
| 9/7/20 | 0.007 |
| 9/8/20 | 0.007 |
| 9/9/20 | 0.007 |
| 9/10/20 | 0.007 |
| 9/11/20 | 0.007 |
| 9/14/20 | 0.007 |
| 9/15/20 | 0.007 |
| 9/16/20 | 0.007 |
| 9/17/20 | 0.007 |
| 9/18/20 | 0.007 |
| 9/21/20 | 0.007 |
| 9/22/20 | 0.007 |
| 9/23/20 | 0.007 |
| 9/24/20 | 0.007 |
| 9/25/20 | 0.007 |
| 9/28/20 | 0.007 |
| 9/29/20 | 0.007 |
| 9/30/20 | 0.007 |
| 10/1/20 | 0.007 |
| 10/2/20 | 0.007 |
| 10/5/20 | 0.008 |
| 10/6/20 | 0.008 |
| 10/7/20 | 0.008 |
| 10/8/20 | 0.008 |
| 10/9/20 | 0.008 |
| 10/12/20 | 0.008 |
| 10/13/20 | 0.007 |
| 10/14/20 | 0.007 |
| 10/15/20 | 0.007 |
| 10/16/20 | 0.008 |
| 10/19/20 | 0.008 |
| 10/20/20 | 0.008 |
| 10/21/20 | 0.008 |
| 10/22/20 | 0.009 |
| 10/23/20 | 0.008 |
| 10/26/20 | 0.008 |
| 10/27/20 | 0.008 |
| 10/28/20 | 0.008 |
| 10/29/20 | 0.008 |
| 10/30/20 | 0.009 |
| 11/2/20 | 0.009 |
| 11/3/20 | 0.009 |
| 11/4/20 | 0.008 |
| 11/5/20 | 0.008 |
| 11/6/20 | 0.008 |
| 11/9/20 | 0.01 |
| 11/10/20 | 0.01 |
| 11/11/20 | 0.01 |
| 11/12/20 | 0.009 |
| 11/13/20 | 0.009 |
| 11/16/20 | 0.009 |
| 11/17/20 | 0.009 |
| 11/18/20 | 0.009 |
| 11/19/20 | 0.009 |
| 11/20/20 | 0.008 |
| 11/23/20 | 0.009 |
| 11/24/20 | 0.009 |
| 11/25/20 | 0.009 |
| 11/26/20 | 0.009 |
| 11/27/20 | 0.008 |
| 11/30/20 | 0.008 |
| 12/1/20 | 0.009 |
| 12/2/20 | 0.01 |
| 12/3/20 | 0.009 |
| 12/4/20 | 0.01 |
| 12/7/20 | 0.009 |
| 12/8/20 | 0.009 |
| 12/9/20 | 0.01 |
| 12/10/20 | 0.009 |
| 12/11/20 | 0.009 |
| 12/14/20 | 0.009 |
| 12/15/20 | 0.009 |
| 12/16/20 | 0.009 |
| 12/17/20 | 0.009 |
| 12/18/20 | 0.01 |
| 12/21/20 | 0.01 |
| 12/22/20 | 0.009 |
| 12/23/20 | 0.01 |
| 12/24/20 | 0.009 |
| 12/25/20 | 0.009 |
| 12/28/20 | 0.009 |
| 12/29/20 | 0.009 |
| 12/30/20 | 0.009 |
| 12/31/20 | 0.009 |
| 1/1/21 | 0.009 |
| 1/4/21 | 0.009 |
| 1/5/21 | 0.01 |
| 1/6/21 | 0.01 |
| 1/7/21 | 0.011 |
| 1/8/21 | 0.011 |
| 1/11/21 | 0.012 |
| 1/12/21 | 0.012 |
| 1/13/21 | 0.011 |
| 1/14/21 | 0.012 |
| 1/15/21 | 0.011 |
| 1/18/21 | 0.011 |
| 1/19/21 | 0.011 |
| 1/20/21 | 0.011 |
| 1/21/21 | 0.011 |
| 1/22/21 | 0.011 |
| 1/25/21 | 0.01 |
| 1/26/21 | 0.01 |
| 1/27/21 | 0.01 |
| 1/28/21 | 0.011 |
| 1/29/21 | 0.011 |
| 2/1/21 | 0.011 |
| 2/2/21 | 0.011 |
| 2/3/21 | 0.012 |
| 2/4/21 | 0.012 |
| 2/5/21 | 0.012 |
| 2/8/21 | 0.012 |
| 2/9/21 | 0.012 |
| 2/10/21 | 0.012 |
| 2/11/21 | 0.012 |
| 2/12/21 | 0.012 |
| 2/15/21 | 0.012 |
| 2/16/21 | 0.013 |
| 2/17/21 | 0.013 |
| 2/18/21 | 0.013 |
| 2/19/21 | 0.013 |
| 2/22/21 | 0.014 |
| 2/23/21 | 0.014 |
| 2/24/21 | 0.014 |
| 2/25/21 | 0.015 |
| 2/26/21 | 0.014 |
| 3/1/21 | 0.014 |
| 3/2/21 | 0.014 |
| 3/3/21 | 0.015 |
| 3/4/21 | 0.015 |
| 3/5/21 | 0.016 |
| 3/8/21 | 0.016 |
| 3/9/21 | 0.016 |
| 3/10/21 | 0.015 |
| 3/11/21 | 0.015 |
| 3/12/21 | 0.016 |
| 3/15/21 | 0.016 |
| 3/16/21 | 0.016 |
| 3/17/21 | 0.016 |
| 3/18/21 | 0.017 |
| 3/19/21 | 0.017 |
| 3/22/21 | 0.017 |
| 3/23/21 | 0.016 |
| 3/24/21 | 0.016 |
| 3/25/21 | 0.016 |
| 3/26/21 | 0.017 |
| 3/29/21 | 0.017 |
| 3/30/21 | 0.017 |
| 3/31/21 | 0.017 |
| 4/1/21 | 0.017 |
| 4/2/21 | 0.017 |
| 4/5/21 | 0.017 |
| 4/6/21 | 0.017 |
| 4/7/21 | 0.017 |
| 4/8/21 | 0.016 |
| 4/9/21 | 0.017 |
| 4/12/21 | 0.017 |
| 4/13/21 | 0.016 |
| 4/14/21 | 0.016 |
| 4/15/21 | 0.016 |
| 4/16/21 | 0.016 |
| 4/19/21 | 0.016 |
| 4/20/21 | 0.016 |
| 4/21/21 | 0.016 |
| 4/22/21 | 0.016 |
| 4/23/21 | 0.016 |
| 4/26/21 | 0.016 |
| 4/27/21 | 0.016 |
| 4/28/21 | 0.016 |
| 4/29/21 | 0.016 |
| 4/30/21 | 0.016 |
| 5/3/21 | 0.016 |
| 5/4/21 | 0.016 |
| 5/5/21 | 0.016 |
| 5/6/21 | 0.016 |
| 5/7/21 | 0.016 |
| 5/10/21 | 0.016 |
| 5/11/21 | 0.016 |
| 5/12/21 | 0.017 |
| 5/13/21 | 0.017 |
| 5/14/21 | 0.016 |
| 5/17/21 | 0.016 |
| 5/18/21 | 0.016 |
| 5/19/21 | 0.017 |
| 5/20/21 | 0.016 |
| 5/21/21 | 0.016 |
| 5/24/21 | 0.016 |
| 5/25/21 | 0.016 |
| 5/26/21 | 0.016 |
| 5/27/21 | 0.016 |
| 5/28/21 | 0.016 |
| 5/31/21 | 0.016 |
| 6/1/21 | 0.016 |
| 6/2/21 | 0.016 |
| 6/3/21 | 0.016 |
| 6/4/21 | 0.016 |
| 6/7/21 | 0.016 |
| 6/8/21 | 0.015 |
| 6/9/21 | 0.015 |
| 6/10/21 | 0.014 |
| 6/11/21 | 0.015 |
| 6/14/21 | 0.015 |
| 6/15/21 | 0.015 |
| 6/16/21 | 0.016 |
| 6/17/21 | 0.015 |
| 6/18/21 | 0.014 |
| 6/21/21 | 0.015 |
| 6/22/21 | 0.015 |
| 6/23/21 | 0.015 |
| 6/24/21 | 0.015 |
| 6/25/21 | 0.015 |
| 6/28/21 | 0.015 |
| 6/29/21 | 0.015 |
| 6/30/21 | 0.014 |
| 7/1/21 | 0.015 |
| 7/2/21 | 0.014 |
| 7/5/21 | 0.014 |
| 7/6/21 | 0.014 |
| 7/7/21 | 0.013 |
| 7/8/21 | 0.013 |
| 7/9/21 | 0.014 |
| 7/12/21 | 0.014 |
| 7/13/21 | 0.014 |
| 7/14/21 | 0.014 |
| 7/15/21 | 0.013 |
| 7/16/21 | 0.013 |
| 7/19/21 | 0.012 |
| 7/20/21 | 0.012 |
| 7/21/21 | 0.013 |
| 7/22/21 | 0.013 |
| 7/23/21 | 0.013 |
| 7/26/21 | 0.013 |
| 7/27/21 | 0.012 |
| 7/28/21 | 0.013 |
| 7/29/21 | 0.013 |
| 7/30/21 | 0.012 |
| 8/2/21 | 0.012 |
| 8/3/21 | 0.012 |
| 8/4/21 | 0.012 |
| 8/5/21 | 0.012 |
| 8/6/21 | 0.013 |
| 8/9/21 | 0.013 |
| 8/10/21 | 0.014 |
| 8/11/21 | 0.014 |
| 8/12/21 | 0.014 |
| 8/13/21 | 0.013 |
| 8/16/21 | 0.013 |
| 8/17/21 | 0.013 |
| 8/18/21 | 0.013 |
| 8/19/21 | 0.012 |
| 8/20/21 | 0.013 |
| 8/23/21 | 0.012 |
| 8/24/21 | 0.013 |
| 8/25/21 | 0.014 |
| 8/26/21 | 0.013 |
| 8/27/21 | 0.013 |
| 8/30/21 | 0.013 |
| 8/31/21 | 0.013 |
| 9/1/21 | 0.013 |
| 9/2/21 | 0.013 |
| 9/3/21 | 0.013 |
| 9/6/21 | 0.013 |
| 9/7/21 | 0.014 |
| 9/8/21 | 0.014 |
| 9/9/21 | 0.013 |
| 9/10/21 | 0.014 |
| 9/13/21 | 0.013 |
| 9/14/21 | 0.013 |
| 9/15/21 | 0.013 |
| 9/16/21 | 0.013 |
| 9/17/21 | 0.014 |
| 9/20/21 | 0.013 |
| 9/21/21 | 0.013 |
| 9/22/21 | 0.013 |
| 9/23/21 | 0.014 |
| 9/24/21 | 0.015 |
| 9/27/21 | 0.015 |
| 9/28/21 | 0.015 |
| 9/29/21 | 0.016 |
| 9/30/21 | 0.015 |
| 10/1/21 | 0.015 |
| 10/4/21 | 0.015 |
| 10/5/21 | 0.015 |
| 10/6/21 | 0.015 |
| 10/7/21 | 0.016 |
| 10/8/21 | 0.016 |
| 10/11/21 | 0.016 |
| 10/12/21 | 0.016 |
| 10/13/21 | 0.016 |
| 10/14/21 | 0.015 |
| 10/15/21 | 0.016 |
| 10/18/21 | 0.016 |
| 10/19/21 | 0.016 |
| 10/20/21 | 0.016 |
| 10/21/21 | 0.017 |
| 10/22/21 | 0.017 |
| 10/25/21 | 0.016 |
| 10/26/21 | 0.016 |
| 10/27/21 | 0.015 |
| 10/28/21 | 0.016 |
| 10/29/21 | 0.016 |
| 11/1/21 | 0.016 |
| 11/2/21 | 0.016 |
| 11/3/21 | 0.016 |
| 11/4/21 | 0.015 |
| 11/5/21 | 0.014 |
| 11/8/21 | 0.015 |
| 11/9/21 | 0.015 |
| 11/10/21 | 0.016 |
| 11/12/21 | 0.016 |
| 11/15/21 | 0.016 |
| 11/16/21 | 0.016 |
| 11/17/21 | 0.016 |
| 11/18/21 | 0.016 |
| 11/19/21 | 0.015 |
| 11/22/21 | 0.016 |
| 11/23/21 | 0.017 |
| 11/24/21 | 0.016 |
| 11/25/21 | 0.016 |
| 11/26/21 | 0.015 |
| 11/29/21 | 0.015 |
| 11/30/21 | 0.014 |
| 12/1/21 | 0.014 |
| 12/2/21 | 0.014 |
| 12/3/21 | 0.014 |
| 12/6/21 | 0.014 |
| 12/7/21 | 0.015 |
| 12/8/21 | 0.015 |
| 12/9/21 | 0.015 |
| 12/10/21 | 0.015 |
| 12/13/21 | 0.014 |
| 12/14/21 | 0.014 |
| 12/15/21 | 0.015 |
| 12/16/21 | 0.014 |
| 12/17/21 | 0.014 |
| 12/20/21 | 0.014 |
| 12/21/21 | 0.015 |
| 12/22/21 | 0.015 |
| 12/23/21 | 0.015 |
| 12/27/21 | 0.015 |
| 12/28/21 | 0.015 |
| 12/29/21 | 0.016 |
| 12/30/21 | 0.015 |
| 12/31/21 | 0.015 |
| 1/3/22 | 0.016 |
| 1/4/22 | 0.017 |
| 1/5/22 | 0.017 |
| 1/6/22 | 0.017 |
| 1/7/22 | 0.018 |
| 1/10/22 | 0.018 |
| 1/11/22 | 0.018 |
| 1/12/22 | 0.017 |
| 1/13/22 | 0.017 |
| 1/14/22 | 0.018 |
| 1/17/22 | 0.018 |
| 1/18/22 | 0.019 |
| 1/19/22 | 0.018 |
| 1/20/22 | 0.018 |
| 1/21/22 | 0.018 |
| 1/24/22 | 0.018 |
| 1/25/22 | 0.018 |
| 1/26/22 | 0.019 |
| 1/27/22 | 0.018 |
| 1/28/22 | 0.018 |
| 1/31/22 | 0.018 |
| 2/1/22 | 0.018 |
| 2/2/22 | 0.018 |
| 2/3/22 | 0.018 |
| 2/4/22 | 0.019 |
| 2/7/22 | 0.019 |
| 2/8/22 | 0.02 |
| 2/9/22 | 0.019 |
| 2/10/22 | 0.02 |
| 2/11/22 | 0.019 |
| 2/14/22 | 0.02 |
| 2/15/22 | 0.02 |
| 2/16/22 | 0.02 |
| 2/17/22 | 0.02 |
| 2/18/22 | 0.019 |
| 2/21/22 | 0.019 |
| 2/22/22 | 0.019 |
| 2/23/22 | 0.02 |
| 2/24/22 | 0.02 |
| 2/25/22 | 0.02 |
| 2/28/22 | 0.018 |
| 3/1/22 | 0.017 |
| 3/2/22 | 0.019 |
| 3/3/22 | 0.019 |
| 3/4/22 | 0.017 |
| 3/7/22 | 0.018 |
| 3/8/22 | 0.019 |
| 3/9/22 | 0.019 |
| 3/10/22 | 0.02 |
| 3/11/22 | 0.02 |
| 3/14/22 | 0.021 |
| 3/15/22 | 0.022 |
| 3/16/22 | 0.022 |
| 3/17/22 | 0.022 |
| 3/18/22 | 0.021 |
| 3/21/22 | 0.023 |
| 3/22/22 | 0.024 |
| 3/23/22 | 0.023 |
| 3/24/22 | 0.023 |
| 3/25/22 | 0.025 |
| 3/28/22 | 0.025 |
| 3/29/22 | 0.024 |
| 3/30/22 | 0.024 |
| 3/31/22 | 0.023 |
| 4/1/22 | 0.024 |
| 4/4/22 | 0.024 |
| 4/5/22 | 0.025 |
| 4/6/22 | 0.026 |
| 4/7/22 | 0.027 |
| 4/8/22 | 0.027 |
| 4/11/22 | 0.028 |
| 4/12/22 | 0.027 |
| 4/13/22 | 0.027 |
| 4/14/22 | 0.028 |
| 4/15/22 | 0.028 |
| 4/18/22 | 0.028 |
| 4/19/22 | 0.029 |
| 4/20/22 | 0.028 |
| 4/21/22 | 0.029 |
| 4/22/22 | 0.029 |
| 4/25/22 | 0.028 |
| 4/26/22 | 0.028 |
| 4/27/22 | 0.028 |
| 4/28/22 | 0.028 |
| 4/29/22 | 0.029 |
| 5/2/22 | 0.03 |
| 5/3/22 | 0.03 |
| 5/4/22 | 0.029 |
| 5/5/22 | 0.03 |
| 5/6/22 | 0.031 |
| 5/9/22 | 0.03 |
| 5/10/22 | 0.03 |
| 5/11/22 | 0.029 |
| 5/12/22 | 0.028 |
| 5/13/22 | 0.029 |
| 5/16/22 | 0.029 |
| 5/17/22 | 0.03 |
| 5/18/22 | 0.029 |
| 5/19/22 | 0.028 |
| 5/20/22 | 0.028 |
| 5/23/22 | 0.029 |
| 5/24/22 | 0.028 |
| 5/25/22 | 0.028 |
| 5/26/22 | 0.028 |
| 5/27/22 | 0.027 |
| 5/30/22 | 0.027 |
| 5/31/22 | 0.028 |
| 6/1/22 | 0.029 |
| 6/2/22 | 0.029 |
| 6/3/22 | 0.03 |
| 6/6/22 | 0.03 |
| 6/7/22 | 0.03 |
| 6/8/22 | 0.03 |
| 6/9/22 | 0.03 |
| 6/10/22 | 0.032 |
| 6/13/22 | 0.034 |
| 6/14/22 | 0.035 |
| 6/15/22 | 0.033 |
| 6/16/22 | 0.033 |
| 6/17/22 | 0.032 |
| 6/20/22 | 0.032 |
| 6/21/22 | 0.033 |
| 6/22/22 | 0.032 |
| 6/23/22 | 0.031 |
| 6/24/22 | 0.031 |
| 6/27/22 | 0.032 |
| 6/28/22 | 0.032 |
| 6/29/22 | 0.031 |
| 6/30/22 | 0.03 |
| 7/1/22 | 0.029 |
| 7/4/22 | 0.029 |
| 7/5/22 | 0.028 |
| 7/6/22 | 0.029 |
| 7/7/22 | 0.03 |
| 7/8/22 | 0.031 |
| 7/11/22 | 0.03 |
| 7/12/22 | 0.03 |
| 7/13/22 | 0.029 |
| 7/14/22 | 0.03 |
| 7/15/22 | 0.029 |
| 7/18/22 | 0.03 |
| 7/19/22 | 0.03 |
| 7/20/22 | 0.03 |
| 7/21/22 | 0.029 |
| 7/22/22 | 0.028 |
| 7/25/22 | 0.028 |
| 7/26/22 | 0.028 |
| 7/27/22 | 0.028 |
| 7/28/22 | 0.027 |
| 7/29/22 | 0.027 |
| 8/1/22 | 0.026 |
| 8/2/22 | 0.028 |
| 8/3/22 | 0.027 |
| 8/4/22 | 0.027 |
| 8/5/22 | 0.028 |
| 8/8/22 | 0.028 |
| 8/9/22 | 0.028 |
| 8/10/22 | 0.028 |
| 8/11/22 | 0.029 |
| 8/12/22 | 0.028 |
| 8/15/22 | 0.028 |
| 8/16/22 | 0.028 |
| 8/17/22 | 0.029 |
| 8/18/22 | 0.029 |
| 8/19/22 | 0.03 |
| 8/22/22 | 0.03 |
| 8/23/22 | 0.03 |
| 8/24/22 | 0.031 |
| 8/25/22 | 0.03 |
| 8/26/22 | 0.03 |
| 8/29/22 | 0.031 |
| 8/30/22 | 0.031 |
| 8/31/22 | 0.032 |
| 9/1/22 | 0.033 |
| 9/2/22 | 0.032 |
| 9/5/22 | 0.032 |
| 9/6/22 | 0.033 |
| 9/7/22 | 0.033 |
| 9/8/22 | 0.033 |
| 9/9/22 | 0.033 |
| 9/12/22 | 0.034 |
| 9/13/22 | 0.034 |
| 9/14/22 | 0.034 |
| 9/15/22 | 0.034 |
| 9/16/22 | 0.034 |
| 9/19/22 | 0.035 |
| 9/20/22 | 0.036 |
| 9/21/22 | 0.035 |
| 9/22/22 | 0.037 |
| 9/23/22 | 0.037 |
| 9/26/22 | 0.039 |
| 9/27/22 | 0.04 |
| 9/28/22 | 0.037 |
| 9/29/22 | 0.038 |
| 9/30/22 | 0.038 |
| 10/3/22 | 0.037 |
| 10/4/22 | 0.036 |
| 10/5/22 | 0.038 |
| 10/6/22 | 0.038 |
| 10/7/22 | 0.039 |
| 10/10/22 | 0.039 |
| 10/11/22 | 0.039 |
| 10/12/22 | 0.039 |
| 10/13/22 | 0.04 |
| 10/14/22 | 0.04 |
| 10/17/22 | 0.04 |
| 10/18/22 | 0.04 |
| 10/19/22 | 0.041 |
| 10/20/22 | 0.042 |
| 10/21/22 | 0.042 |
| 10/24/22 | 0.042 |
| 10/25/22 | 0.041 |
| 10/26/22 | 0.04 |
| 10/27/22 | 0.04 |
| 10/28/22 | 0.04 |
| 10/31/22 | 0.041 |
| 11/1/22 | 0.041 |
| 11/2/22 | 0.041 |
| 11/3/22 | 0.041 |
| 11/4/22 | 0.042 |
| 11/7/22 | 0.042 |
| 11/8/22 | 0.041 |
| 11/9/22 | 0.041 |
| 11/10/22 | 0.038 |
| 11/14/22 | 0.039 |
| 11/15/22 | 0.038 |
| 11/16/22 | 0.037 |
| 11/17/22 | 0.038 |
| 11/18/22 | 0.038 |
| 11/21/22 | 0.038 |
| 11/22/22 | 0.038 |
| 11/23/22 | 0.037 |
| 11/24/22 | 0.037 |
| 11/25/22 | 0.037 |
| 11/28/22 | 0.037 |
| 11/29/22 | 0.038 |
| 11/30/22 | 0.037 |
| 12/1/22 | 0.035 |
| 12/2/22 | 0.035 |
| 12/5/22 | 0.036 |
| 12/6/22 | 0.035 |
| 12/7/22 | 0.034 |
| 12/8/22 | 0.035 |
| 12/9/22 | 0.036 |
| 12/12/22 | 0.036 |
| 12/13/22 | 0.035 |
| 12/14/22 | 0.035 |
| 12/15/22 | 0.034 |
| 12/16/22 | 0.035 |
| 12/19/22 | 0.036 |
| 12/20/22 | 0.037 |
| 12/21/22 | 0.037 |
| 12/22/22 | 0.037 |
| 12/23/22 | 0.038 |
| 12/26/22 | 0.038 |
| 12/27/22 | 0.038 |
| 12/28/22 | 0.039 |
| 12/29/22 | 0.038 |
| 12/30/22 | 0.039 |
| 1/2/23 | 0.039 |
| 1/3/23 | 0.038 |
| 1/4/23 | 0.037 |
| 1/5/23 | 0.037 |
| 1/6/23 | 0.036 |
| 1/9/23 | 0.035 |
| 1/10/23 | 0.036 |
| 1/11/23 | 0.035 |
| 1/12/23 | 0.034 |
| 1/13/23 | 0.035 |
| 1/16/23 | 0.035 |
| 1/17/23 | 0.035 |
| 1/18/23 | 0.034 |
| 1/19/23 | 0.034 |
| 1/20/23 | 0.035 |
| 1/23/23 | 0.035 |
| 1/24/23 | 0.035 |
| 1/25/23 | 0.035 |
| 1/26/23 | 0.035 |
| 1/27/23 | 0.035 |
| 1/30/23 | 0.036 |
| 1/31/23 | 0.035 |
| 2/1/23 | 0.034 |
| 2/2/23 | 0.034 |
| 2/3/23 | 0.035 |
| 2/6/23 | 0.036 |
| 2/7/23 | 0.037 |
| 2/8/23 | 0.036 |
| 2/9/23 | 0.037 |
| 2/10/23 | 0.037 |
| 2/13/23 | 0.037 |
| 2/14/23 | 0.038 |
| 2/15/23 | 0.038 |
| 2/16/23 | 0.039 |
| 2/17/23 | 0.038 |
| 2/20/23 | 0.038 |
| 2/21/23 | 0.04 |
| 2/22/23 | 0.039 |
| 2/23/23 | 0.039 |
| 2/24/23 | 0.04 |
| 2/27/23 | 0.039 |
| 2/28/23 | 0.039 |
| 3/1/23 | 0.04 |
| 3/2/23 | 0.041 |
| 3/3/23 | 0.04 |
| 3/6/23 | 0.04 |
| 3/7/23 | 0.04 |
| 3/8/23 | 0.04 |
| 3/9/23 | 0.039 |
| 3/10/23 | 0.037 |
| 3/13/23 | 0.036 |
| 3/14/23 | 0.036 |
| 3/15/23 | 0.035 |
| 3/16/23 | 0.036 |
| 3/17/23 | 0.034 |
| 3/20/23 | 0.035 |
| 3/21/23 | 0.036 |
| 3/22/23 | 0.035 |
| 3/23/23 | 0.034 |
| 3/24/23 | 0.034 |
| 3/27/23 | 0.035 |
| 3/28/23 | 0.036 |
| 3/29/23 | 0.036 |
| 3/30/23 | 0.036 |
| 3/31/23 | 0.035 |
| 4/3/23 | 0.034 |
| 4/4/23 | 0.034 |
| 4/5/23 | 0.033 |
| 4/6/23 | 0.033 |
| 4/7/23 | 0.034 |
| 4/10/23 | 0.034 |
| 4/11/23 | 0.034 |
| 4/12/23 | 0.034 |
| 4/13/23 | 0.034 |
| 4/14/23 | 0.035 |
| 4/17/23 | 0.036 |
| 4/18/23 | 0.036 |
| 4/19/23 | 0.036 |
| 4/20/23 | 0.035 |
| 4/21/23 | 0.036 |
| 4/24/23 | 0.035 |
| 4/25/23 | 0.034 |
| 4/26/23 | 0.034 |
| 4/27/23 | 0.035 |
| 4/28/23 | 0.034 |
| 5/1/23 | 0.036 |
| 5/2/23 | 0.034 |
| 5/3/23 | 0.034 |
| 5/4/23 | 0.034 |
| 5/5/23 | 0.034 |
| 5/8/23 | 0.035 |
| 5/9/23 | 0.035 |
| 5/10/23 | 0.034 |
| 5/11/23 | 0.034 |
| 5/12/23 | 0.035 |
| 5/15/23 | 0.035 |
| 5/16/23 | 0.035 |
| 5/17/23 | 0.036 |
| 5/18/23 | 0.036 |
| 5/19/23 | 0.037 |
| 5/22/23 | 0.037 |
| 5/23/23 | 0.037 |
| 5/24/23 | 0.037 |
| 5/25/23 | 0.038 |
| 5/26/23 | 0.038 |
| 5/29/23 | 0.038 |
| 5/30/23 | 0.037 |
| 5/31/23 | 0.036 |
| 6/1/23 | 0.036 |
| 6/2/23 | 0.037 |
| 6/5/23 | 0.037 |
| 6/6/23 | 0.037 |
| 6/7/23 | 0.038 |
| 6/8/23 | 0.037 |
| 6/9/23 | 0.038 |
| 6/12/23 | 0.037 |
| 6/13/23 | 0.038 |
| 6/14/23 | 0.038 |
| 6/15/23 | 0.037 |
| 6/16/23 | 0.038 |
| 6/19/23 | 0.038 |
| 6/20/23 | 0.037 |
| 6/21/23 | 0.037 |
| 6/22/23 | 0.038 |
| 6/23/23 | 0.037 |
| 6/26/23 | 0.037 |
| 6/27/23 | 0.038 |
| 6/28/23 | 0.037 |
| 6/29/23 | 0.038 |
| 6/30/23 | 0.038 |
| 7/3/23 | 0.039 |
| 7/4/23 | 0.039 |
| 7/5/23 | 0.04 |
| 7/6/23 | 0.04 |
| 7/7/23 | 0.041 |
| 7/10/23 | 0.04 |
| 7/11/23 | 0.04 |
| 7/12/23 | 0.039 |
| 7/13/23 | 0.038 |
| 7/14/23 | 0.038 |
| 7/17/23 | 0.038 |
| 7/18/23 | 0.038 |
| 7/19/23 | 0.038 |
| 7/20/23 | 0.038 |
| 7/21/23 | 0.038 |
| 7/24/23 | 0.039 |
| 7/25/23 | 0.039 |
| 7/26/23 | 0.039 |
| 7/27/23 | 0.04 |
| 7/28/23 | 0.04 |
| 7/31/23 | 0.04 |
| 8/1/23 | 0.04 |
| 8/2/23 | 0.041 |
| 8/3/23 | 0.042 |
| 8/4/23 | 0.04 |
| 8/7/23 | 0.041 |
| 8/8/23 | 0.04 |
| 8/9/23 | 0.04 |
| 8/10/23 | 0.041 |
| 8/11/23 | 0.042 |
| 8/14/23 | 0.042 |
| 8/15/23 | 0.042 |
| 8/16/23 | 0.043 |
| 8/17/23 | 0.043 |
| 8/18/23 | 0.043 |
| 8/21/23 | 0.043 |
| 8/22/23 | 0.043 |
| 8/23/23 | 0.042 |
| 8/24/23 | 0.042 |
| 8/25/23 | 0.042 |
| 8/28/23 | 0.042 |
| 8/29/23 | 0.041 |
| 8/30/23 | 0.041 |
| 8/31/23 | 0.041 |
| 9/1/23 | 0.042 |
| 9/4/23 | 0.042 |
| 9/5/23 | 0.043 |
| 9/6/23 | 0.043 |
| 9/7/23 | 0.043 |
| 9/8/23 | 0.043 |
| 9/11/23 | 0.043 |
| 9/12/23 | 0.043 |
| 9/13/23 | 0.042 |
| 9/14/23 | 0.043 |
| 9/15/23 | 0.043 |
| 9/18/23 | 0.043 |
| 9/19/23 | 0.044 |
| 9/20/23 | 0.044 |
| 9/21/23 | 0.045 |
| 9/22/23 | 0.044 |
| 9/25/23 | 0.046 |
| 9/26/23 | 0.046 |
| 9/27/23 | 0.046 |
| 9/28/23 | 0.046 |
| 9/29/23 | 0.046 |
| 10/2/23 | 0.047 |
| 10/3/23 | 0.048 |
| 10/4/23 | 0.047 |
| 10/5/23 | 0.047 |
| 10/6/23 | 0.048 |
| 10/10/23 | 0.047 |
| 10/11/23 | 0.046 |
| 10/12/23 | 0.047 |
| 10/13/23 | 0.046 |
| 10/16/23 | 0.047 |
| 10/17/23 | 0.048 |
| 10/18/23 | 0.049 |
| 10/19/23 | 0.05 |
| 10/20/23 | 0.049 |
| 10/23/23 | 0.049 |
| 10/24/23 | 0.048 |
| 10/25/23 | 0.05 |
| 10/26/23 | 0.049 |
| 10/27/23 | 0.048 |
| 10/30/23 | 0.049 |
| 10/31/23 | 0.049 |
| 11/1/23 | 0.048 |
| 11/2/23 | 0.047 |
| 11/3/23 | 0.046 |
| 11/6/23 | 0.047 |
| 11/7/23 | 0.046 |
| 11/8/23 | 0.045 |
| 11/9/23 | 0.046 |
| 11/10/23 | 0.046 |
| 11/13/23 | 0.046 |
| 11/14/23 | 0.044 |
| 11/15/23 | 0.045 |
| 11/16/23 | 0.045 |
| 11/17/23 | 0.044 |
| 11/20/23 | 0.044 |
| 11/21/23 | 0.044 |
| 11/22/23 | 0.044 |
| 11/23/23 | 0.044 |
| 11/24/23 | 0.045 |
| 11/27/23 | 0.044 |
| 11/28/23 | 0.043 |
| 11/29/23 | 0.043 |
| 11/30/23 | 0.044 |
| 12/1/23 | 0.042 |
| 12/4/23 | 0.043 |
| 12/5/23 | 0.042 |
| 12/6/23 | 0.041 |
| 12/7/23 | 0.041 |
| 12/8/23 | 0.042 |
| 12/11/23 | 0.042 |
| 12/12/23 | 0.042 |
| 12/13/23 | 0.04 |
| 12/14/23 | 0.039 |
| 12/15/23 | 0.039 |
| 12/18/23 | 0.04 |
| 12/19/23 | 0.039 |
| 12/20/23 | 0.039 |
| 12/21/23 | 0.039 |
| 12/22/23 | 0.039 |
| 12/25/23 | 0.039 |
| 12/26/23 | 0.039 |
| 12/27/23 | 0.038 |
| 12/28/23 | 0.038 |
| 12/29/23 | 0.039 |